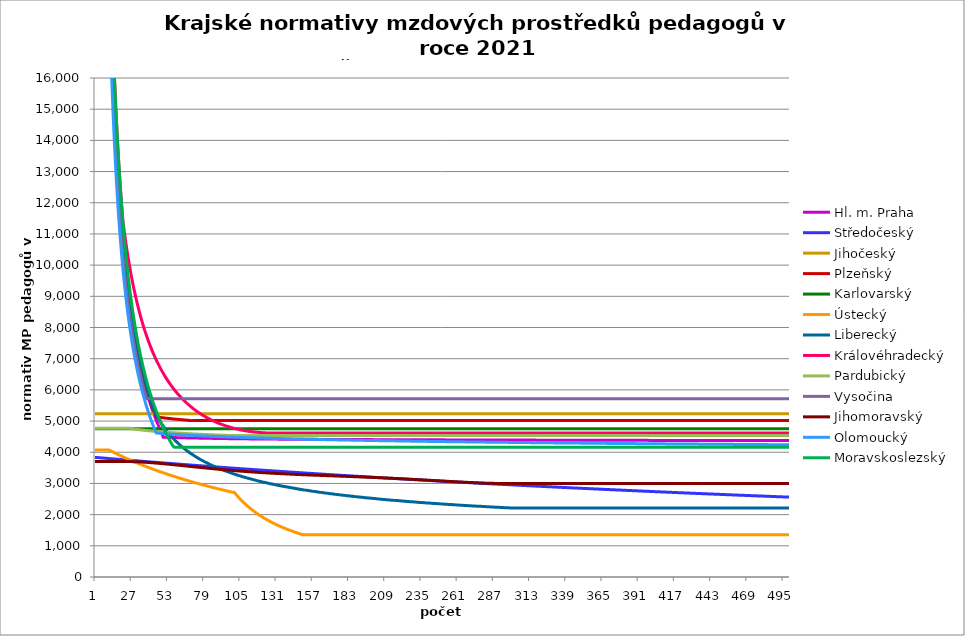
| Category | Hl. m. Praha | Středočeský | Jihočeský | Plzeňský | Karlovarský  | Ústecký   | Liberecký | Královéhradecký | Pardubický | Vysočina | Jihomoravský | Olomoucký | Moravskoslezský |
|---|---|---|---|---|---|---|---|---|---|---|---|---|---|
| 0 | 225960 | 3836.464 | 5236.605 | 230646 | 4750 | 4072.8 | 231600 | 239766 | 4771.19 | 31022.571 | 3704.243 | 207810 | 239400 |
| 1 | 112980 | 3832.635 | 5236.605 | 115323 | 4750 | 4072.8 | 115800 | 119883 | 4771.19 | 31022.571 | 3704.243 | 103905 | 119700 |
| 2 | 75320 | 3828.814 | 5236.605 | 76882 | 4750 | 4072.8 | 77200 | 79922 | 4771.19 | 31022.571 | 3704.243 | 69270 | 79800 |
| 3 | 56490 | 3825 | 5236.605 | 57661.5 | 4750 | 4072.8 | 57900 | 59941.5 | 4771.19 | 31022.571 | 3704.243 | 51952.5 | 59850 |
| 4 | 45192 | 3821.194 | 5236.605 | 46129.2 | 4750 | 4072.8 | 46320 | 47953.2 | 4771.19 | 31022.571 | 3704.243 | 41562 | 47880 |
| 5 | 37660 | 3817.396 | 5236.605 | 38441 | 4750 | 4072.8 | 38600 | 39961 | 4771.19 | 31022.571 | 3704.243 | 34635 | 39900 |
| 6 | 32280 | 3813.605 | 5236.605 | 32949.429 | 4750 | 4072.8 | 33085.714 | 34252.286 | 4771.19 | 31022.571 | 3704.243 | 29687.143 | 34200 |
| 7 | 28245 | 3809.821 | 5236.605 | 28830.75 | 4750 | 4072.8 | 28950 | 29970.75 | 4771.19 | 27144.75 | 3704.243 | 25976.25 | 29925 |
| 8 | 25106.667 | 3806.046 | 5236.605 | 25627.333 | 4750 | 4072.8 | 25733.333 | 26640.667 | 4771.19 | 24128.667 | 3704.243 | 23090 | 26600 |
| 9 | 22596 | 3802.277 | 5236.605 | 23064.6 | 4750 | 4072.8 | 23160 | 23976.6 | 4771.19 | 21715.8 | 3704.243 | 20781 | 23940 |
| 10 | 20541.818 | 3798.516 | 5236.605 | 20967.818 | 4750 | 4072.8 | 21054.545 | 21796.909 | 4771.19 | 19741.636 | 3704.243 | 18891.818 | 21763.636 |
| 11 | 18830 | 3794.763 | 5236.605 | 19220.5 | 4750 | 4050.119 | 19300 | 19980.5 | 4771.19 | 18096.5 | 3704.243 | 17317.5 | 19950 |
| 12 | 17381.538 | 3791.017 | 5236.605 | 17742 | 4750 | 4027.69 | 17815.385 | 18443.538 | 4771.19 | 16704.462 | 3704.243 | 15985.385 | 18415.385 |
| 13 | 16140 | 3787.278 | 5236.605 | 16474.714 | 4750 | 4005.114 | 16542.857 | 17126.143 | 4771.19 | 15511.286 | 3704.243 | 14843.571 | 17100 |
| 14 | 15064 | 3783.547 | 5236.605 | 15376.4 | 4750 | 3983.178 | 15440 | 15984.4 | 4771.19 | 14477.2 | 3704.243 | 13854 | 15960 |
| 15 | 14122.5 | 3779.823 | 5236.605 | 14415.375 | 4750 | 3961.482 | 14475 | 14985.375 | 4771.19 | 13572.375 | 3704.243 | 12988.125 | 14962.5 |
| 16 | 13291.765 | 3776.106 | 5236.605 | 13567.412 | 4750 | 3940.021 | 13623.529 | 14103.882 | 4771.19 | 12774 | 3704.243 | 12224.118 | 14082.353 |
| 17 | 12553.333 | 3772.397 | 5236.605 | 12813.667 | 4750 | 3918.791 | 12866.667 | 13320.333 | 4771.19 | 12064.333 | 3704.243 | 11545 | 13300 |
| 18 | 11892.632 | 3768.695 | 5236.605 | 12139.263 | 4750 | 3897.789 | 12189.474 | 12619.263 | 4771.19 | 11429.368 | 3704.243 | 10937.368 | 12600 |
| 19 | 11298 | 3765 | 5236.605 | 11532.3 | 4750 | 3876.642 | 11580 | 11988.3 | 4771.19 | 10857.9 | 3704.243 | 10390.5 | 11970 |
| 20 | 10760 | 3761.312 | 5236.605 | 10983.143 | 4750 | 3856.088 | 11028.571 | 11433.763 | 4771.19 | 10340.857 | 3704.243 | 9895.714 | 11400 |
| 21 | 10270.909 | 3757.632 | 5236.605 | 10483.909 | 4750 | 3835.751 | 10527.273 | 11087.445 | 4771.19 | 9870.818 | 3704.243 | 9445.909 | 10881.818 |
| 22 | 9824.348 | 3753.959 | 5236.605 | 10028.087 | 4750 | 3815.627 | 10069.565 | 10763.906 | 4771.19 | 9441.652 | 3703.934 | 9035.217 | 10408.696 |
| 23 | 9415 | 3750.293 | 5236.605 | 9610.25 | 4750 | 3795.713 | 9650 | 10465.561 | 4771.19 | 9048.25 | 3703.315 | 8658.75 | 9975 |
| 24 | 9038.4 | 3746.634 | 5236.605 | 9225.84 | 4750 | 3775.656 | 9264 | 10183.309 | 4771.19 | 8686.32 | 3702.697 | 8312.4 | 9576 |
| 25 | 8690.769 | 3742.982 | 5236.605 | 8871 | 4750 | 3756.156 | 8907.692 | 9922.036 | 4763.993 | 8352.231 | 3701.77 | 7992.692 | 9207.692 |
| 26 | 8368.889 | 3739.338 | 5236.605 | 8542.444 | 4750 | 3736.857 | 8577.778 | 9675.787 | 4757.211 | 8042.889 | 3700.534 | 7696.667 | 8866.667 |
| 27 | 8070 | 3735.7 | 5236.605 | 8237.357 | 4750 | 3717.754 | 8271.429 | 9445.184 | 4750.694 | 7755.643 | 3699.299 | 7421.786 | 8550 |
| 28 | 7791.724 | 3732.07 | 5236.605 | 7953.31 | 4750 | 3698.847 | 7986.207 | 9227.093 | 4744.423 | 7488.207 | 3697.757 | 7165.862 | 8255.172 |
| 29 | 7532 | 3728.447 | 5236.605 | 7688.2 | 4750 | 3680.13 | 7720 | 9023.937 | 4738.381 | 7238.6 | 3695.908 | 6927 | 7980 |
| 30 | 7289.032 | 3724.83 | 5236.605 | 7440.194 | 4750 | 3661.273 | 7470.968 | 8829.534 | 4732.551 | 7005.097 | 3694.061 | 6703.548 | 7722.581 |
| 31 | 7061.25 | 3721.221 | 5236.605 | 7207.688 | 4750 | 3642.934 | 7237.5 | 8648.007 | 4726.919 | 6786.188 | 3691.908 | 6494.062 | 7481.25 |
| 32 | 6847.273 | 3717.619 | 5236.605 | 6989.273 | 4750 | 3624.778 | 7018.182 | 8475.292 | 4721.474 | 6580.545 | 3689.758 | 6297.273 | 7254.545 |
| 33 | 6645.882 | 3714.023 | 5236.605 | 6783.706 | 4750 | 3606.801 | 6811.765 | 8310.78 | 4716.204 | 6387 | 3687.304 | 6112.059 | 7041.176 |
| 34 | 6456 | 3710.435 | 5236.605 | 6589.886 | 4750 | 3589.002 | 6617.143 | 8155.306 | 4711.097 | 6204.514 | 3684.853 | 5937.429 | 6840 |
| 35 | 6276.667 | 3706.853 | 5236.605 | 6406.833 | 4750 | 3571.378 | 6433.333 | 8008.216 | 4706.145 | 6032.167 | 3682.099 | 5772.5 | 6650 |
| 36 | 6107.027 | 3703.279 | 5236.605 | 6233.676 | 4750 | 3553.617 | 6259.459 | 7867.629 | 4701.339 | 5869.135 | 3679.35 | 5616.486 | 6470.27 |
| 37 | 5946.316 | 3699.711 | 5236.605 | 6069.632 | 4750 | 3536.338 | 6094.737 | 7734.387 | 4696.67 | 5714.684 | 3676.299 | 5468.684 | 6300 |
| 38 | 5793.846 | 3696.15 | 5236.605 | 5914 | 4750 | 3519.226 | 5938.462 | 7607.996 | 4692.131 | 5714.684 | 3673.254 | 5328.462 | 6138.462 |
| 39 | 5649 | 3692.596 | 5236.605 | 5766.15 | 4750 | 3502.279 | 5790 | 7486.838 | 4687.716 | 5714.684 | 3669.911 | 5195.25 | 5985 |
| 40 | 5511.22 | 3689.049 | 5236.605 | 5625.512 | 4750 | 3485.494 | 5648.78 | 7370.612 | 4683.418 | 5714.684 | 3666.573 | 5068.537 | 5839.024 |
| 41 | 5380 | 3685.509 | 5236.605 | 5491.571 | 4750 | 3468.574 | 5514.286 | 7260.136 | 4679.231 | 5714.684 | 3663.241 | 4947.857 | 5700 |
| 42 | 5254.884 | 3681.975 | 5236.605 | 5363.86 | 4750 | 3452.111 | 5386.047 | 7155.058 | 4675.149 | 5714.684 | 3659.614 | 4832.791 | 5567.442 |
| 43 | 5135.455 | 3678.448 | 5236.605 | 5241.955 | 4750 | 3435.802 | 5281.298 | 7054.016 | 4671.169 | 5714.684 | 3655.993 | 4722.955 | 5440.909 |
| 44 | 5021.333 | 3674.928 | 5236.605 | 5131.739 | 4750 | 3419.647 | 5196.908 | 6957.806 | 4667.284 | 5714.684 | 3652.38 | 4618 | 5320 |
| 45 | 4912.174 | 3671.415 | 5236.605 | 5126.036 | 4750 | 3403.644 | 5116.941 | 6865.168 | 4663.491 | 5714.684 | 3648.474 | 4614.411 | 5204.348 |
| 46 | 4807.66 | 3667.908 | 5236.605 | 5119.778 | 4750 | 3387.789 | 5041.041 | 6775.922 | 4659.786 | 5714.684 | 3644.576 | 4610.828 | 5093.617 |
| 47 | 4707.5 | 3664.408 | 5236.605 | 5114.102 | 4750 | 3371.802 | 4968.889 | 6690.833 | 4656.164 | 5714.684 | 3640.686 | 4607.25 | 4987.5 |
| 48 | 4611.429 | 3660.915 | 5236.605 | 5109.004 | 4750 | 3356.242 | 4900.199 | 6609.676 | 4652.622 | 5714.684 | 3636.507 | 4603.677 | 4885.714 |
| 49 | 4480.666 | 3657.429 | 5236.605 | 5103.352 | 4750 | 3340.825 | 4834.714 | 6531.354 | 4649.157 | 5714.684 | 3632.634 | 4600.111 | 4788 |
| 50 | 4479.334 | 3653.949 | 5236.605 | 5098.276 | 4750 | 3325.549 | 4772.202 | 6455.735 | 4645.766 | 5714.684 | 3628.473 | 4596.549 | 4694.118 |
| 51 | 4478.002 | 3650.475 | 5236.605 | 5093.21 | 4750 | 3310.412 | 4712.454 | 6383.546 | 4642.446 | 5714.684 | 3624.025 | 4593.501 | 4603.846 |
| 52 | 4476.672 | 3647.009 | 5236.605 | 5088.154 | 4750 | 3295.146 | 4655.281 | 6313.785 | 4639.193 | 5714.684 | 3619.884 | 4590.457 | 4516.981 |
| 53 | 4475.342 | 3643.548 | 5236.605 | 5083.107 | 4750 | 3280.284 | 4600.509 | 6247.16 | 4636.005 | 5714.684 | 3615.457 | 4586.911 | 4433.333 |
| 54 | 4474.455 | 3640.095 | 5236.605 | 5078.63 | 4750 | 3265.555 | 4547.981 | 6182.723 | 4632.881 | 5714.684 | 3611.041 | 4583.876 | 4352.727 |
| 55 | 4473.127 | 3636.648 | 5236.605 | 5073.603 | 4750 | 3250.958 | 4497.554 | 6121.164 | 4629.816 | 5714.684 | 3606.636 | 4580.844 | 4275 |
| 56 | 4471.799 | 3633.207 | 5236.605 | 5069.143 | 4750 | 3236.491 | 4449.097 | 6060.819 | 4626.81 | 5714.684 | 3602.242 | 4577.817 | 4200 |
| 57 | 4470.472 | 3629.773 | 5236.605 | 5064.69 | 4750 | 3222.152 | 4402.489 | 6003.906 | 4623.86 | 5714.684 | 3597.858 | 4575.297 | 4159.138 |
| 58 | 4469.588 | 3626.346 | 5236.605 | 5060.246 | 4750 | 3207.687 | 4357.619 | 5948.053 | 4620.964 | 5714.684 | 3593.194 | 4572.277 | 4159.138 |
| 59 | 4468.262 | 3622.925 | 5236.605 | 5055.809 | 4750 | 3193.602 | 4314.387 | 5894.677 | 4618.12 | 5714.684 | 3588.832 | 4569.261 | 4159.138 |
| 60 | 4467.378 | 3619.51 | 5236.605 | 5051.38 | 4750 | 3179.639 | 4272.698 | 5843.675 | 4615.327 | 5714.684 | 3584.191 | 4566.751 | 4159.138 |
| 61 | 4466.054 | 3616.102 | 5236.605 | 5046.958 | 4750 | 3165.799 | 4232.465 | 5794.248 | 4612.582 | 5714.684 | 3579.563 | 4563.742 | 4159.138 |
| 62 | 4465.171 | 3612.7 | 5236.605 | 5043.096 | 4750 | 3152.078 | 4193.609 | 5746.339 | 4609.885 | 5714.684 | 3574.946 | 4561.238 | 4159.138 |
| 63 | 4463.848 | 3609.305 | 5236.605 | 5038.689 | 4750 | 3138.234 | 4156.055 | 5699.893 | 4607.233 | 5714.684 | 3570.341 | 4558.736 | 4159.138 |
| 64 | 4462.967 | 3605.915 | 5236.605 | 5034.84 | 4750 | 3124.751 | 4119.735 | 5655.525 | 4604.625 | 5714.684 | 3565.747 | 4556.238 | 4159.138 |
| 65 | 4462.085 | 3602.533 | 5236.605 | 5030.996 | 4750 | 3111.383 | 4084.585 | 5612.5 | 4602.06 | 5714.684 | 3561.166 | 4553.243 | 4159.138 |
| 66 | 4460.764 | 3599.157 | 5236.605 | 5027.158 | 4750 | 3098.129 | 4050.544 | 5570.771 | 4599.536 | 5714.684 | 3556.596 | 4550.75 | 4159.138 |
| 67 | 4459.884 | 3595.787 | 5236.605 | 5023.326 | 4750 | 3084.987 | 4017.558 | 5530.934 | 4597.052 | 5714.684 | 3552.038 | 4548.758 | 4159.138 |
| 68 | 4459.003 | 3592.423 | 5236.605 | 5019.499 | 4750 | 3071.957 | 3985.575 | 5492.292 | 4594.608 | 5714.684 | 3547.492 | 4546.27 | 4159.138 |
| 69 | 4458.124 | 3589.065 | 5236.605 | 5015.679 | 4750 | 3058.806 | 3954.547 | 5454.806 | 4592.201 | 5714.684 | 3542.675 | 4543.785 | 4159.138 |
| 70 | 4457.244 | 3585.714 | 5236.605 | 5014.043 | 4750 | 3045.995 | 3924.428 | 5418.441 | 4589.83 | 5714.684 | 3538.152 | 4541.302 | 4159.138 |
| 71 | 4456.365 | 3582.369 | 5236.605 | 5014.043 | 4750 | 3033.291 | 3895.176 | 5383.766 | 4587.495 | 5714.684 | 3533.641 | 4538.823 | 4159.138 |
| 72 | 4455.047 | 3579.031 | 5236.605 | 5014.043 | 4750 | 3020.693 | 3866.752 | 5350.128 | 4585.195 | 5714.684 | 3528.861 | 4536.841 | 4159.138 |
| 73 | 4454.169 | 3575.698 | 5236.605 | 5014.043 | 4750 | 3008.199 | 3839.118 | 5317.498 | 4582.928 | 5714.684 | 3524.374 | 4534.366 | 4159.138 |
| 74 | 4453.291 | 3572.372 | 5236.605 | 5014.043 | 4750 | 2995.587 | 3812.239 | 5286.429 | 4580.694 | 5714.684 | 3519.898 | 4532.388 | 4159.138 |
| 75 | 4452.414 | 3569.052 | 5236.605 | 5014.043 | 4750 | 2983.299 | 3786.083 | 5255.721 | 4578.491 | 5714.684 | 3515.155 | 4529.918 | 4159.138 |
| 76 | 4451.537 | 3565.738 | 5236.605 | 5014.043 | 4750 | 2971.112 | 3760.618 | 5226.507 | 4576.32 | 5714.684 | 3510.703 | 4527.944 | 4159.138 |
| 77 | 4450.66 | 3562.43 | 5236.605 | 5014.043 | 4750 | 2959.024 | 3735.815 | 5198.179 | 4574.178 | 5714.684 | 3506.262 | 4525.972 | 4159.138 |
| 78 | 4449.783 | 3559.129 | 5236.605 | 5014.043 | 4750 | 2947.033 | 3711.647 | 5170.714 | 4572.066 | 5714.684 | 3501.832 | 4524.001 | 4159.138 |
| 79 | 4448.907 | 3555.833 | 5236.605 | 5014.043 | 4750 | 2935.14 | 3688.088 | 5144.641 | 4569.982 | 5714.684 | 3497.413 | 4521.54 | 4159.138 |
| 80 | 4448.469 | 3552.544 | 5236.605 | 5014.043 | 4750 | 2923.132 | 3665.114 | 5118.83 | 4567.926 | 5714.684 | 3493.006 | 4519.574 | 4159.138 |
| 81 | 4447.594 | 3549.261 | 5236.605 | 5014.043 | 4750 | 2911.43 | 3642.7 | 5094.359 | 4565.897 | 5714.684 | 3488.609 | 4517.609 | 4159.138 |
| 82 | 4446.718 | 3545.983 | 5236.605 | 5014.043 | 4750 | 2899.822 | 3620.826 | 5070.657 | 4563.894 | 5714.684 | 3484.224 | 4515.645 | 4159.138 |
| 83 | 4445.844 | 3542.712 | 5236.605 | 5014.043 | 4750 | 2888.306 | 3599.471 | 5047.705 | 4561.917 | 5714.684 | 3479.849 | 4513.684 | 4159.138 |
| 84 | 4444.969 | 3539.447 | 5236.605 | 5014.043 | 4750 | 2876.881 | 3578.614 | 5026.014 | 4559.965 | 5714.684 | 3475.486 | 4511.724 | 4159.138 |
| 85 | 4444.095 | 3536.188 | 5236.605 | 5014.043 | 4750 | 2865.546 | 3558.237 | 5004.508 | 4558.038 | 5714.684 | 3471.133 | 4509.766 | 4159.138 |
| 86 | 4443.658 | 3532.935 | 5236.605 | 5014.043 | 4750 | 2854.1 | 3538.322 | 4983.704 | 4556.134 | 5714.684 | 3467.063 | 4507.809 | 4159.138 |
| 87 | 4442.784 | 3529.688 | 5236.605 | 5014.043 | 4750 | 2842.943 | 3518.853 | 4964.099 | 4554.254 | 5714.684 | 3462.731 | 4506.343 | 4159.138 |
| 88 | 4441.911 | 3526.446 | 5236.605 | 5014.043 | 4750 | 2831.873 | 3499.814 | 4945.158 | 4552.396 | 5714.684 | 3458.68 | 4504.389 | 4159.138 |
| 89 | 4441.474 | 3523.211 | 5236.605 | 5014.043 | 4750 | 2820.889 | 3481.189 | 4926.361 | 4550.561 | 5714.684 | 3454.37 | 4502.437 | 4159.138 |
| 90 | 4440.601 | 3519.982 | 5236.605 | 5014.043 | 4750 | 2809.99 | 3462.963 | 4908.711 | 4548.748 | 5714.684 | 3450.338 | 4500.487 | 4159.138 |
| 91 | 4439.729 | 3516.758 | 5236.605 | 5014.043 | 4750 | 2798.983 | 3445.124 | 4891.686 | 4546.955 | 5714.684 | 3446.316 | 4499.026 | 4159.138 |
| 92 | 4439.293 | 3513.541 | 5236.605 | 5014.043 | 4750 | 2788.252 | 3427.657 | 4875.275 | 4545.184 | 5714.684 | 3442.304 | 4497.079 | 4159.138 |
| 93 | 4438.421 | 3510.329 | 5236.605 | 5014.043 | 4750 | 2777.603 | 3410.55 | 4859.465 | 4543.433 | 5714.684 | 3438.301 | 4495.619 | 4159.138 |
| 94 | 4437.549 | 3507.123 | 5236.605 | 5014.043 | 4750 | 2767.036 | 3393.792 | 4844.736 | 4541.701 | 5714.684 | 3434.307 | 4493.675 | 4159.138 |
| 95 | 4437.113 | 3503.923 | 5236.605 | 5014.043 | 4750 | 2756.548 | 3377.371 | 4830.097 | 4539.99 | 5714.684 | 3430.587 | 4492.218 | 4159.138 |
| 96 | 4436.242 | 3500.729 | 5236.605 | 5014.043 | 4750 | 2746.14 | 3361.275 | 4816.029 | 4538.297 | 5714.684 | 3426.611 | 4490.277 | 4159.138 |
| 97 | 4435.807 | 3497.541 | 5236.605 | 5014.043 | 4750 | 2735.626 | 3345.495 | 4802.524 | 4536.622 | 5714.684 | 3422.908 | 4488.822 | 4159.138 |
| 98 | 4434.936 | 3494.359 | 5236.605 | 5014.043 | 4750 | 2725.375 | 3330.02 | 4789.573 | 4534.966 | 5714.684 | 3418.95 | 4486.883 | 4159.138 |
| 99 | 4434.066 | 3491.182 | 5236.605 | 5014.043 | 4750 | 2715.2 | 3314.841 | 4777.643 | 4533.328 | 5714.684 | 3415.264 | 4485.431 | 4159.138 |
| 100 | 4433.631 | 3488.011 | 5236.605 | 5014.043 | 4750 | 2715.2 | 3299.949 | 4765.772 | 4533.328 | 5714.684 | 3411.586 | 4483.979 | 4159.138 |
| 101 | 4433.196 | 3484.846 | 5236.605 | 5014.043 | 4750 | 2660.917 | 3285.335 | 4754.432 | 4533.328 | 5714.684 | 3407.915 | 4482.045 | 4159.138 |
| 102 | 4432.761 | 3481.686 | 5236.605 | 5014.043 | 4750 | 2608.762 | 3270.99 | 4743.615 | 4533.328 | 5714.684 | 3404.514 | 4480.595 | 4159.138 |
| 103 | 4432.326 | 3478.533 | 5236.605 | 5014.043 | 4750 | 2558.613 | 3256.907 | 4733.314 | 4533.328 | 5714.684 | 3400.859 | 4479.146 | 4159.138 |
| 104 | 4431.892 | 3475.385 | 5236.605 | 5014.043 | 4750 | 2510.355 | 3243.078 | 4723.522 | 4533.328 | 5714.684 | 3397.472 | 4477.699 | 4159.138 |
| 105 | 4431.457 | 3472.242 | 5236.605 | 5014.043 | 4750 | 2463.735 | 3229.495 | 4714.699 | 4533.328 | 5714.684 | 3393.832 | 4476.252 | 4159.138 |
| 106 | 4431.023 | 3469.106 | 5236.605 | 5014.043 | 4750 | 2418.958 | 3216.152 | 4705.908 | 4533.328 | 5714.684 | 3390.459 | 4474.806 | 4159.138 |
| 107 | 4430.588 | 3465.975 | 5236.605 | 5014.043 | 4750 | 2375.78 | 3203.041 | 4697.61 | 4533.328 | 5714.684 | 3387.092 | 4472.88 | 4159.138 |
| 108 | 4430.154 | 3462.849 | 5236.605 | 5014.043 | 4750 | 2334.117 | 3190.155 | 4689.341 | 4533.328 | 5714.684 | 3383.733 | 4471.436 | 4159.138 |
| 109 | 4429.72 | 3459.73 | 5236.605 | 5014.043 | 4750 | 2293.889 | 3177.489 | 4682.015 | 4533.328 | 5714.684 | 3380.38 | 4469.994 | 4159.138 |
| 110 | 4429.286 | 3456.616 | 5236.605 | 5014.043 | 4750 | 2255.025 | 3165.037 | 4675.168 | 4533.328 | 5714.684 | 3377.29 | 4468.552 | 4159.138 |
| 111 | 4428.851 | 3453.507 | 5236.605 | 5014.043 | 4750 | 2217.455 | 3152.792 | 4668.341 | 4533.328 | 5714.684 | 3373.95 | 4467.111 | 4159.138 |
| 112 | 4428.417 | 3450.404 | 5236.605 | 5014.043 | 4750 | 2181.117 | 3140.749 | 4662.44 | 4533.328 | 5714.684 | 3370.873 | 4465.671 | 4159.138 |
| 113 | 4427.984 | 3447.307 | 5236.605 | 5014.043 | 4750 | 2145.838 | 3128.903 | 4656.555 | 4533.328 | 5714.684 | 3367.801 | 4464.232 | 4159.138 |
| 114 | 4427.55 | 3444.215 | 5236.605 | 5014.043 | 4750 | 2111.791 | 3117.248 | 4651.135 | 4533.328 | 5714.684 | 3364.734 | 4463.273 | 4159.138 |
| 115 | 4427.116 | 3441.129 | 5236.605 | 5014.043 | 4750 | 2078.808 | 3105.78 | 4646.178 | 4533.328 | 5714.684 | 3361.674 | 4461.836 | 4159.138 |
| 116 | 4426.682 | 3438.048 | 5236.605 | 5014.043 | 4750 | 2046.839 | 3094.493 | 4641.68 | 4533.328 | 5714.684 | 3358.619 | 4460.399 | 4159.138 |
| 117 | 4426.249 | 3434.973 | 5236.605 | 5014.043 | 4750 | 2015.838 | 3083.382 | 4637.64 | 4533.328 | 5714.684 | 3355.569 | 4458.964 | 4159.138 |
| 118 | 4425.815 | 3431.903 | 5236.605 | 5014.043 | 4750 | 1985.763 | 3072.444 | 4634.055 | 4533.328 | 5714.684 | 3352.778 | 4457.529 | 4159.138 |
| 119 | 4425.382 | 3428.839 | 5236.605 | 5014.043 | 4750 | 1956.572 | 3061.674 | 4630.475 | 4533.328 | 5714.684 | 3349.992 | 4456.095 | 4159.138 |
| 120 | 4424.949 | 3425.781 | 5236.605 | 5014.043 | 4750 | 1928.226 | 3051.067 | 4627.347 | 4533.328 | 5714.684 | 3347.211 | 4455.14 | 4159.138 |
| 121 | 4424.515 | 3422.727 | 5236.605 | 5014.043 | 4750 | 1900.602 | 3040.62 | 4624.67 | 4533.328 | 5714.684 | 3344.434 | 4453.708 | 4159.138 |
| 122 | 4424.082 | 3419.679 | 5236.605 | 5014.043 | 4750 | 1873.844 | 3030.329 | 4622.441 | 4533.328 | 5714.684 | 3341.662 | 4452.276 | 4159.138 |
| 123 | 4424.082 | 3416.637 | 5236.605 | 5014.043 | 4750 | 1847.829 | 3020.19 | 4620.659 | 4533.328 | 5714.684 | 3338.895 | 4450.846 | 4159.138 |
| 124 | 4423.649 | 3413.6 | 5236.605 | 5014.043 | 4750 | 1822.527 | 3010.199 | 4618.879 | 4533.328 | 5714.684 | 3336.132 | 4449.893 | 4159.138 |
| 125 | 4423.216 | 3410.568 | 5236.605 | 5014.043 | 4750 | 1797.908 | 3000.352 | 4617.545 | 4533.328 | 5714.684 | 3333.624 | 4448.464 | 4159.138 |
| 126 | 4422.783 | 3407.542 | 5236.605 | 5014.043 | 4750 | 1773.945 | 2990.647 | 4616.655 | 4533.328 | 5714.684 | 3330.87 | 4447.036 | 4159.138 |
| 127 | 4422.351 | 3404.521 | 5236.605 | 5014.043 | 4750 | 1750.613 | 2981.08 | 4616.211 | 4533.328 | 5714.684 | 3328.37 | 4446.085 | 4159.138 |
| 128 | 4421.918 | 3401.506 | 5236.605 | 5014.043 | 4750 | 1727.886 | 2971.648 | 4615.767 | 4533.328 | 5714.684 | 3325.874 | 4444.658 | 4159.138 |
| 129 | 4421.485 | 3398.496 | 5236.605 | 5014.043 | 4750 | 1705.67 | 2962.347 | 4615.767 | 4533.328 | 5714.684 | 3323.381 | 4443.708 | 4159.138 |
| 130 | 4421.485 | 3395.491 | 5236.605 | 5014.043 | 4750 | 1684.089 | 2953.175 | 4615.767 | 4533.328 | 5714.684 | 3320.893 | 4442.283 | 4159.138 |
| 131 | 4421.053 | 3392.491 | 5236.605 | 5014.043 | 4750 | 1663.046 | 2944.129 | 4615.767 | 4533.328 | 5714.684 | 3318.656 | 4441.334 | 4159.138 |
| 132 | 4420.62 | 3389.497 | 5236.605 | 5014.043 | 4750 | 1642.523 | 2935.206 | 4615.767 | 4533.328 | 5714.684 | 3316.174 | 4439.91 | 4159.138 |
| 133 | 4420.188 | 3386.508 | 5236.605 | 5014.043 | 4750 | 1622.5 | 2926.402 | 4615.767 | 4533.328 | 5714.684 | 3313.944 | 4438.962 | 4159.138 |
| 134 | 4419.756 | 3383.524 | 5236.605 | 5014.043 | 4750 | 1602.96 | 2917.717 | 4615.767 | 4533.328 | 5714.684 | 3311.47 | 4437.54 | 4159.138 |
| 135 | 4419.756 | 3380.546 | 5236.605 | 5014.043 | 4750 | 1583.884 | 2909.146 | 4615.767 | 4533.328 | 5714.684 | 3309.246 | 4436.593 | 4159.138 |
| 136 | 4419.323 | 3377.573 | 5236.605 | 5014.043 | 4750 | 1565.257 | 2900.688 | 4615.767 | 4533.328 | 5714.684 | 3307.025 | 4435.172 | 4159.138 |
| 137 | 4418.891 | 3374.605 | 5236.605 | 5014.043 | 4750 | 1547.005 | 2892.339 | 4615.767 | 4533.328 | 5714.684 | 3304.807 | 4434.226 | 4159.138 |
| 138 | 4418.459 | 3371.642 | 5236.605 | 5014.043 | 4750 | 1529.231 | 2884.099 | 4615.767 | 4533.328 | 5714.684 | 3302.592 | 4432.807 | 4159.138 |
| 139 | 4418.027 | 3368.684 | 5236.605 | 5014.043 | 4750 | 1511.86 | 2875.963 | 4615.767 | 4533.328 | 5714.684 | 3300.625 | 4431.862 | 4159.138 |
| 140 | 4418.027 | 3365.732 | 5236.605 | 5014.043 | 4750 | 1494.88 | 2867.931 | 4615.767 | 4533.328 | 5714.684 | 3298.416 | 4430.917 | 4159.138 |
| 141 | 4417.595 | 3362.785 | 5236.605 | 5014.043 | 4750 | 1478.277 | 2860 | 4615.767 | 4533.328 | 5714.684 | 3296.209 | 4429.5 | 4159.138 |
| 142 | 4417.164 | 3359.843 | 5236.605 | 5014.043 | 4750 | 1462.038 | 2852.168 | 4615.767 | 4533.328 | 5714.684 | 3294.25 | 4428.556 | 4159.138 |
| 143 | 4416.732 | 3356.906 | 5236.605 | 5014.043 | 4750 | 1446.153 | 2844.433 | 4615.767 | 4533.328 | 5714.684 | 3292.294 | 4427.613 | 4159.138 |
| 144 | 4416.732 | 3353.974 | 5236.605 | 5014.043 | 4750 | 1430.609 | 2836.793 | 4615.767 | 4533.328 | 5714.684 | 3290.096 | 4426.198 | 4159.138 |
| 145 | 4416.3 | 3351.047 | 5236.605 | 5014.043 | 4750 | 1415.346 | 2829.246 | 4615.767 | 4533.328 | 5714.684 | 3288.144 | 4425.256 | 4159.138 |
| 146 | 4415.869 | 3348.126 | 5236.605 | 5014.043 | 4750 | 1400.454 | 2821.79 | 4615.767 | 4533.328 | 5714.684 | 3286.195 | 4424.313 | 4159.138 |
| 147 | 4415.437 | 3345.209 | 5236.605 | 5014.043 | 4750 | 1385.872 | 2814.423 | 4615.767 | 4533.328 | 5714.684 | 3284.248 | 4423.372 | 4159.138 |
| 148 | 4415.437 | 3342.298 | 5236.605 | 5014.043 | 4750 | 1371.59 | 2807.144 | 4615.767 | 4533.328 | 5714.684 | 3282.303 | 4421.96 | 4159.138 |
| 149 | 4415.006 | 3339.391 | 5236.605 | 5014.043 | 4750 | 1357.6 | 2799.951 | 4615.767 | 4533.328 | 5714.684 | 3280.361 | 4421.019 | 4159.138 |
| 150 | 4415.006 | 3336.49 | 5236.605 | 5014.043 | 4750 | 1357.6 | 2792.842 | 4615.767 | 4533.328 | 5714.684 | 3278.421 | 4420.079 | 4159.138 |
| 151 | 4414.575 | 3333.594 | 5236.605 | 5014.043 | 4750 | 1357.6 | 2785.815 | 4615.767 | 4533.328 | 5714.684 | 3276.725 | 4419.139 | 4159.138 |
| 152 | 4414.575 | 3330.703 | 5236.605 | 5014.043 | 4750 | 1357.6 | 2778.87 | 4615.767 | 4533.328 | 5714.684 | 3274.79 | 4417.73 | 4159.138 |
| 153 | 4414.143 | 3327.816 | 5236.605 | 5014.043 | 4750 | 1357.6 | 2772.004 | 4615.767 | 4533.328 | 5714.684 | 3273.098 | 4416.791 | 4159.138 |
| 154 | 4414.143 | 3324.935 | 5236.605 | 5014.043 | 4750 | 1357.6 | 2765.216 | 4615.767 | 4533.328 | 5714.684 | 3271.166 | 4415.852 | 4159.138 |
| 155 | 4413.712 | 3322.059 | 5236.605 | 5014.043 | 4750 | 1357.6 | 2758.504 | 4615.767 | 4533.328 | 5714.684 | 3269.478 | 4414.914 | 4159.138 |
| 156 | 4413.712 | 3319.188 | 5236.605 | 5014.043 | 4750 | 1357.6 | 2751.868 | 4615.767 | 4533.328 | 5714.684 | 3267.551 | 4413.976 | 4159.138 |
| 157 | 4413.281 | 3316.321 | 5236.605 | 5014.043 | 4750 | 1357.6 | 2745.305 | 4615.767 | 4533.328 | 5714.684 | 3265.866 | 4413.039 | 4159.138 |
| 158 | 4413.281 | 3313.46 | 5236.605 | 5014.043 | 4750 | 1357.6 | 2738.815 | 4615.767 | 4533.328 | 5714.684 | 3264.184 | 4412.102 | 4159.138 |
| 159 | 4412.85 | 3310.603 | 5236.605 | 5014.043 | 4750 | 1357.6 | 2732.395 | 4615.767 | 4533.328 | 5714.684 | 3262.263 | 4411.165 | 4159.138 |
| 160 | 4412.85 | 3307.752 | 5236.605 | 5014.043 | 4750 | 1357.6 | 2726.046 | 4615.767 | 4533.328 | 5714.684 | 3260.584 | 4409.761 | 4159.138 |
| 161 | 4412.419 | 3304.905 | 5236.605 | 5014.043 | 4750 | 1357.6 | 2719.764 | 4615.767 | 4533.328 | 5714.684 | 3258.907 | 4408.826 | 4159.138 |
| 162 | 4412.419 | 3302.064 | 5236.605 | 5014.043 | 4750 | 1357.6 | 2713.55 | 4615.767 | 4533.328 | 5714.684 | 3257.231 | 4407.891 | 4159.138 |
| 163 | 4411.989 | 3299.227 | 5236.605 | 5014.043 | 4750 | 1357.6 | 2707.403 | 4615.767 | 4533.328 | 5714.684 | 3255.557 | 4406.956 | 4159.138 |
| 164 | 4411.989 | 3296.395 | 5236.605 | 5014.043 | 4750 | 1357.6 | 2701.32 | 4615.767 | 4533.328 | 5714.684 | 3253.885 | 4406.021 | 4159.138 |
| 165 | 4411.558 | 3293.568 | 5236.605 | 5014.043 | 4750 | 1357.6 | 2695.301 | 4615.767 | 4533.328 | 5714.684 | 3252.215 | 4405.087 | 4159.138 |
| 166 | 4411.558 | 3290.746 | 5236.605 | 5014.043 | 4750 | 1357.6 | 2689.344 | 4615.767 | 4533.328 | 5714.684 | 3250.546 | 4404.154 | 4159.138 |
| 167 | 4411.127 | 3287.928 | 5236.605 | 5014.043 | 4750 | 1357.6 | 2683.449 | 4615.767 | 4533.328 | 5714.684 | 3248.879 | 4403.221 | 4159.138 |
| 168 | 4411.127 | 3285.115 | 5236.605 | 5014.043 | 4750 | 1357.6 | 2677.615 | 4615.767 | 4533.328 | 5714.684 | 3247.214 | 4402.288 | 4159.138 |
| 169 | 4410.697 | 3282.308 | 5236.605 | 5014.043 | 4750 | 1357.6 | 2671.84 | 4615.767 | 4533.328 | 5714.684 | 3245.55 | 4401.356 | 4159.138 |
| 170 | 4410.697 | 3279.505 | 5236.605 | 5014.043 | 4750 | 1357.6 | 2666.124 | 4615.767 | 4533.328 | 5714.684 | 3243.889 | 4400.424 | 4159.138 |
| 171 | 4410.266 | 3276.706 | 5236.605 | 5014.043 | 4750 | 1357.6 | 2660.465 | 4615.767 | 4533.328 | 5714.684 | 3242.228 | 4399.492 | 4159.138 |
| 172 | 4410.266 | 3273.913 | 5236.605 | 5014.043 | 4750 | 1357.6 | 2654.863 | 4615.767 | 4533.328 | 5714.684 | 3240.57 | 4399.026 | 4159.138 |
| 173 | 4409.836 | 3271.124 | 5236.605 | 5014.043 | 4750 | 1357.6 | 2649.316 | 4615.767 | 4533.328 | 5714.684 | 3238.913 | 4398.095 | 4159.138 |
| 174 | 4409.836 | 3268.34 | 5236.605 | 5014.043 | 4750 | 1357.6 | 2643.824 | 4615.767 | 4533.328 | 5714.684 | 3237.258 | 4397.165 | 4159.138 |
| 175 | 4409.406 | 3265.561 | 5236.605 | 5014.043 | 4750 | 1357.6 | 2638.386 | 4615.767 | 4533.328 | 5714.684 | 3235.605 | 4396.234 | 4159.138 |
| 176 | 4409.406 | 3262.787 | 5236.605 | 5014.043 | 4750 | 1357.6 | 2633.001 | 4615.767 | 4533.328 | 5714.684 | 3233.717 | 4395.305 | 4159.138 |
| 177 | 4408.976 | 3260.017 | 5236.605 | 5014.043 | 4750 | 1357.6 | 2627.668 | 4615.767 | 4533.328 | 5714.684 | 3232.068 | 4394.375 | 4159.138 |
| 178 | 4408.976 | 3257.252 | 5236.605 | 5014.043 | 4750 | 1357.6 | 2622.386 | 4615.767 | 4533.328 | 5714.684 | 3230.42 | 4393.446 | 4159.138 |
| 179 | 4408.546 | 3254.492 | 5236.605 | 5014.043 | 4750 | 1357.6 | 2617.155 | 4615.767 | 4533.328 | 5714.684 | 3228.773 | 4392.517 | 4159.138 |
| 180 | 4408.546 | 3251.736 | 5236.605 | 5014.043 | 4750 | 1357.6 | 2611.973 | 4615.767 | 4533.328 | 5714.684 | 3227.129 | 4391.589 | 4159.138 |
| 181 | 4408.546 | 3248.985 | 5236.605 | 5014.043 | 4750 | 1357.6 | 2606.841 | 4615.767 | 4533.328 | 5714.684 | 3225.485 | 4391.125 | 4159.138 |
| 182 | 4408.115 | 3246.238 | 5236.605 | 5014.043 | 4750 | 1357.6 | 2601.756 | 4615.767 | 4533.328 | 5714.684 | 3223.844 | 4390.198 | 4159.138 |
| 183 | 4408.115 | 3243.497 | 5236.605 | 5014.043 | 4750 | 1357.6 | 2596.718 | 4615.767 | 4533.328 | 5714.684 | 3222.204 | 4389.27 | 4159.138 |
| 184 | 4407.686 | 3240.759 | 5236.605 | 5014.043 | 4750 | 1357.6 | 2591.728 | 4615.767 | 4533.328 | 5714.684 | 3220.333 | 4388.343 | 4159.138 |
| 185 | 4407.686 | 3238.027 | 5236.605 | 5014.043 | 4750 | 1357.6 | 2586.783 | 4615.767 | 4533.328 | 5714.684 | 3218.696 | 4387.417 | 4159.138 |
| 186 | 4407.256 | 3235.299 | 5236.605 | 5014.043 | 4750 | 1357.6 | 2581.883 | 4615.767 | 4533.328 | 5714.684 | 3217.062 | 4386.954 | 4159.138 |
| 187 | 4407.256 | 3232.576 | 5236.605 | 5014.043 | 4750 | 1357.6 | 2577.028 | 4615.767 | 4533.328 | 5714.684 | 3215.196 | 4386.028 | 4159.138 |
| 188 | 4406.826 | 3229.857 | 5236.605 | 5014.043 | 4750 | 1357.6 | 2572.217 | 4615.767 | 4533.328 | 5714.684 | 3213.565 | 4385.102 | 4159.138 |
| 189 | 4406.826 | 3227.143 | 5236.605 | 5014.043 | 4750 | 1357.6 | 2567.449 | 4615.767 | 4533.328 | 5714.684 | 3211.703 | 4384.177 | 4159.138 |
| 190 | 4406.826 | 3224.433 | 5236.605 | 5014.043 | 4750 | 1357.6 | 2562.723 | 4615.767 | 4533.328 | 5714.684 | 3210.076 | 4383.715 | 4159.138 |
| 191 | 4406.396 | 3221.728 | 5236.605 | 5014.043 | 4750 | 1357.6 | 2558.039 | 4615.767 | 4533.328 | 5714.684 | 3208.218 | 4382.79 | 4159.138 |
| 192 | 4406.396 | 3219.028 | 5236.605 | 5014.043 | 4750 | 1357.6 | 2553.397 | 4615.767 | 4533.328 | 5714.684 | 3206.363 | 4381.866 | 4159.138 |
| 193 | 4405.967 | 3216.332 | 5236.605 | 5014.043 | 4750 | 1357.6 | 2548.795 | 4615.767 | 4533.328 | 5714.684 | 3204.741 | 4380.942 | 4159.138 |
| 194 | 4405.967 | 3213.64 | 5236.605 | 5014.043 | 4750 | 1357.6 | 2544.233 | 4615.767 | 4533.328 | 5714.684 | 3202.889 | 4380.481 | 4159.138 |
| 195 | 4405.537 | 3210.953 | 5236.605 | 5014.043 | 4750 | 1357.6 | 2539.711 | 4615.767 | 4533.328 | 5714.684 | 3201.039 | 4379.557 | 4159.138 |
| 196 | 4405.537 | 3208.271 | 5236.605 | 5014.043 | 4750 | 1357.6 | 2535.228 | 4615.767 | 4533.328 | 5714.684 | 3199.192 | 4378.635 | 4159.138 |
| 197 | 4405.537 | 3205.593 | 5236.605 | 5014.043 | 4750 | 1357.6 | 2530.783 | 4615.767 | 4533.328 | 5714.684 | 3197.347 | 4378.173 | 4159.138 |
| 198 | 4405.108 | 3202.919 | 5236.605 | 5014.043 | 4750 | 1357.6 | 2526.376 | 4615.767 | 4533.328 | 5714.684 | 3195.504 | 4377.251 | 4159.138 |
| 199 | 4405.108 | 3200.25 | 5236.605 | 5014.043 | 4750 | 1357.6 | 2522.007 | 4615.767 | 4533.328 | 5714.684 | 3193.663 | 4376.329 | 4159.138 |
| 200 | 4404.678 | 3197.585 | 5236.605 | 5014.043 | 4750 | 1357.6 | 2517.674 | 4615.767 | 4533.328 | 5714.684 | 3191.594 | 4375.869 | 4159.138 |
| 201 | 4404.678 | 3194.925 | 5236.605 | 5014.043 | 4750 | 1357.6 | 2513.377 | 4615.767 | 4533.328 | 5714.684 | 3189.758 | 4374.947 | 4159.138 |
| 202 | 4404.678 | 3192.269 | 5236.605 | 5014.043 | 4750 | 1357.6 | 2509.116 | 4615.767 | 4533.328 | 5714.684 | 3187.694 | 4374.027 | 4159.138 |
| 203 | 4404.249 | 3189.618 | 5236.605 | 5014.043 | 4750 | 1357.6 | 2504.89 | 4615.767 | 4533.328 | 5714.684 | 3185.862 | 4373.566 | 4159.138 |
| 204 | 4404.249 | 3186.971 | 5236.605 | 5014.043 | 4750 | 1357.6 | 2500.7 | 4615.767 | 4533.328 | 5714.684 | 3183.804 | 4372.646 | 4159.138 |
| 205 | 4403.82 | 3184.328 | 5236.605 | 5014.043 | 4750 | 1357.6 | 2496.543 | 4615.767 | 4533.328 | 5714.684 | 3181.976 | 4371.726 | 4159.138 |
| 206 | 4403.82 | 3181.69 | 5236.605 | 5014.043 | 4750 | 1357.6 | 2492.42 | 4615.767 | 4533.328 | 5714.684 | 3179.923 | 4371.266 | 4159.138 |
| 207 | 4403.82 | 3179.056 | 5236.605 | 5014.043 | 4750 | 1357.6 | 2488.331 | 4615.767 | 4533.328 | 5714.684 | 3177.872 | 4370.347 | 4159.138 |
| 208 | 4403.391 | 3176.427 | 5236.605 | 5014.043 | 4750 | 1357.6 | 2484.274 | 4615.767 | 4533.328 | 5714.684 | 3175.824 | 4369.887 | 4159.138 |
| 209 | 4403.391 | 3173.802 | 5236.605 | 5014.043 | 4750 | 1357.6 | 2480.25 | 4615.767 | 4533.328 | 5714.684 | 3173.778 | 4368.969 | 4159.138 |
| 210 | 4402.962 | 3171.181 | 5236.605 | 5014.043 | 4750 | 1357.6 | 2476.258 | 4615.767 | 4533.328 | 5714.684 | 3171.735 | 4368.05 | 4159.138 |
| 211 | 4402.962 | 3168.564 | 5236.605 | 5014.043 | 4750 | 1357.6 | 2472.298 | 4615.767 | 4533.328 | 5714.684 | 3169.468 | 4367.591 | 4159.138 |
| 212 | 4402.962 | 3165.952 | 5236.605 | 5014.043 | 4750 | 1357.6 | 2468.369 | 4615.767 | 4533.328 | 5714.684 | 3167.431 | 4366.674 | 4159.138 |
| 213 | 4402.533 | 3163.344 | 5236.605 | 5014.043 | 4750 | 1357.6 | 2464.47 | 4615.767 | 4533.328 | 5714.684 | 3165.396 | 4366.215 | 4159.138 |
| 214 | 4402.533 | 3160.741 | 5236.605 | 5014.043 | 4750 | 1357.6 | 2460.602 | 4615.767 | 4533.328 | 5714.684 | 3163.138 | 4365.298 | 4159.138 |
| 215 | 4402.104 | 3158.141 | 5236.605 | 5014.043 | 4750 | 1357.6 | 2456.764 | 4615.767 | 4533.328 | 5714.684 | 3160.884 | 4364.839 | 4159.138 |
| 216 | 4402.104 | 3155.546 | 5236.605 | 5014.043 | 4750 | 1357.6 | 2452.956 | 4615.767 | 4533.328 | 5714.684 | 3158.857 | 4363.923 | 4159.138 |
| 217 | 4402.104 | 3152.956 | 5236.605 | 5014.043 | 4750 | 1357.6 | 2449.177 | 4615.767 | 4533.328 | 5714.684 | 3156.609 | 4363.465 | 4159.138 |
| 218 | 4401.675 | 3150.369 | 5236.605 | 5014.043 | 4750 | 1357.6 | 2445.426 | 4615.767 | 4533.328 | 5714.684 | 3154.364 | 4362.549 | 4159.138 |
| 219 | 4401.675 | 3147.787 | 5236.605 | 5014.043 | 4750 | 1357.6 | 2441.705 | 4615.767 | 4533.328 | 5714.684 | 3152.122 | 4361.633 | 4159.138 |
| 220 | 4401.675 | 3145.209 | 5236.605 | 5014.043 | 4750 | 1357.6 | 2438.011 | 4615.767 | 4533.328 | 5714.684 | 3149.883 | 4361.175 | 4159.138 |
| 221 | 4401.247 | 3142.635 | 5236.605 | 5014.043 | 4750 | 1357.6 | 2434.345 | 4615.767 | 4533.328 | 5714.684 | 3147.647 | 4360.26 | 4159.138 |
| 222 | 4401.247 | 3140.065 | 5236.605 | 5014.043 | 4750 | 1357.6 | 2430.706 | 4615.767 | 4533.328 | 5714.684 | 3145.191 | 4359.803 | 4159.138 |
| 223 | 4400.818 | 3137.5 | 5236.605 | 5014.043 | 4750 | 1357.6 | 2427.095 | 4615.767 | 4533.328 | 5714.684 | 3142.962 | 4358.888 | 4159.138 |
| 224 | 4400.818 | 3134.939 | 5236.605 | 5014.043 | 4750 | 1357.6 | 2423.51 | 4615.767 | 4533.328 | 5714.684 | 3140.514 | 4358.431 | 4159.138 |
| 225 | 4400.818 | 3132.382 | 5236.605 | 5014.043 | 4750 | 1357.6 | 2419.951 | 4615.767 | 4533.328 | 5714.684 | 3138.292 | 4357.974 | 4159.138 |
| 226 | 4400.389 | 3129.829 | 5236.605 | 5014.043 | 4750 | 1357.6 | 2416.419 | 4615.767 | 4533.328 | 5714.684 | 3135.851 | 4357.06 | 4159.138 |
| 227 | 4400.389 | 3127.28 | 5236.605 | 5014.043 | 4750 | 1357.6 | 2412.913 | 4615.767 | 4533.328 | 5714.684 | 3133.413 | 4356.604 | 4159.138 |
| 228 | 4400.389 | 3124.736 | 5236.605 | 5014.043 | 4750 | 1357.6 | 2409.431 | 4615.767 | 4533.328 | 5714.684 | 3131.201 | 4355.691 | 4159.138 |
| 229 | 4399.961 | 3122.195 | 5236.605 | 5014.043 | 4750 | 1357.6 | 2405.975 | 4615.767 | 4533.328 | 5714.684 | 3128.771 | 4355.234 | 4159.138 |
| 230 | 4399.961 | 3119.659 | 5236.605 | 5014.043 | 4750 | 1357.6 | 2402.544 | 4615.767 | 4533.328 | 5714.684 | 3126.345 | 4354.322 | 4159.138 |
| 231 | 4399.961 | 3117.127 | 5236.605 | 5014.043 | 4750 | 1357.6 | 2399.138 | 4615.767 | 4533.328 | 5714.684 | 3123.922 | 4353.865 | 4159.138 |
| 232 | 4399.533 | 3114.599 | 5236.605 | 5014.043 | 4750 | 1357.6 | 2395.755 | 4615.767 | 4533.328 | 5714.684 | 3121.503 | 4352.953 | 4159.138 |
| 233 | 4399.533 | 3112.075 | 5236.605 | 5014.043 | 4750 | 1357.6 | 2392.397 | 4615.767 | 4533.328 | 5714.684 | 3118.869 | 4352.498 | 4159.138 |
| 234 | 4399.533 | 3109.555 | 5236.605 | 5014.043 | 4750 | 1357.6 | 2389.062 | 4615.767 | 4533.328 | 5714.684 | 3116.458 | 4352.042 | 4159.138 |
| 235 | 4399.104 | 3107.039 | 5236.605 | 5014.043 | 4750 | 1357.6 | 2385.751 | 4615.767 | 4533.328 | 5714.684 | 3114.051 | 4351.131 | 4159.138 |
| 236 | 4399.104 | 3104.527 | 5236.605 | 5014.043 | 4750 | 1357.6 | 2382.462 | 4615.767 | 4533.328 | 5714.684 | 3111.429 | 4350.675 | 4159.138 |
| 237 | 4398.676 | 3102.019 | 5236.605 | 5014.043 | 4750 | 1357.6 | 2379.197 | 4615.767 | 4533.328 | 5714.684 | 3109.03 | 4349.765 | 4159.138 |
| 238 | 4398.676 | 3099.516 | 5236.605 | 5014.043 | 4750 | 1357.6 | 2375.954 | 4615.767 | 4533.328 | 5714.684 | 3106.416 | 4349.309 | 4159.138 |
| 239 | 4398.676 | 3097.016 | 5236.605 | 5014.043 | 4750 | 1357.6 | 2372.734 | 4615.767 | 4533.328 | 5714.684 | 3104.025 | 4348.399 | 4159.138 |
| 240 | 4398.248 | 3094.521 | 5236.605 | 5014.043 | 4750 | 1357.6 | 2369.535 | 4615.767 | 4533.328 | 5714.684 | 3101.42 | 4347.944 | 4159.138 |
| 241 | 4398.248 | 3092.029 | 5236.605 | 5014.043 | 4750 | 1357.6 | 2366.358 | 4615.767 | 4533.328 | 5714.684 | 3098.819 | 4347.49 | 4159.138 |
| 242 | 4398.248 | 3089.541 | 5236.605 | 5014.043 | 4750 | 1357.6 | 2363.203 | 4615.767 | 4533.328 | 5714.684 | 3096.439 | 4346.58 | 4159.138 |
| 243 | 4397.82 | 3087.058 | 5236.605 | 5014.043 | 4750 | 1357.6 | 2360.069 | 4615.767 | 4533.328 | 5714.684 | 3093.847 | 4346.126 | 4159.138 |
| 244 | 4397.82 | 3084.578 | 5236.605 | 5014.043 | 4750 | 1357.6 | 2356.957 | 4615.767 | 4533.328 | 5714.684 | 3091.259 | 4345.671 | 4159.138 |
| 245 | 4397.82 | 3082.103 | 5236.605 | 5014.043 | 4750 | 1357.6 | 2353.865 | 4615.767 | 4533.328 | 5714.684 | 3088.675 | 4344.763 | 4159.138 |
| 246 | 4397.392 | 3079.631 | 5236.605 | 5014.043 | 4750 | 1357.6 | 2350.793 | 4615.767 | 4533.328 | 5714.684 | 3086.096 | 4344.309 | 4159.138 |
| 247 | 4397.392 | 3077.163 | 5236.605 | 5014.043 | 4750 | 1357.6 | 2347.742 | 4615.767 | 4533.328 | 5714.684 | 3083.521 | 4343.855 | 4159.138 |
| 248 | 4397.392 | 3074.7 | 5236.605 | 5014.043 | 4750 | 1357.6 | 2344.712 | 4615.767 | 4533.328 | 5714.684 | 3081.164 | 4342.947 | 4159.138 |
| 249 | 4396.964 | 3072.24 | 5236.605 | 5014.043 | 4750 | 1357.6 | 2341.701 | 4615.767 | 4533.328 | 5714.684 | 3078.598 | 4342.493 | 4159.138 |
| 250 | 4396.964 | 3069.784 | 5236.605 | 5014.043 | 4750 | 1357.6 | 2338.709 | 4615.767 | 4533.328 | 5714.684 | 3076.035 | 4342.039 | 4159.138 |
| 251 | 4396.964 | 3067.332 | 5236.605 | 5014.043 | 4750 | 1357.6 | 2335.738 | 4615.767 | 4533.328 | 5714.684 | 3073.477 | 4341.132 | 4159.138 |
| 252 | 4396.537 | 3064.884 | 5236.605 | 5014.043 | 4750 | 1357.6 | 2332.785 | 4615.767 | 4533.328 | 5714.684 | 3070.923 | 4340.679 | 4159.138 |
| 253 | 4396.537 | 3062.44 | 5236.605 | 5014.043 | 4750 | 1357.6 | 2329.852 | 4615.767 | 4533.328 | 5714.684 | 3068.373 | 4340.226 | 4159.138 |
| 254 | 4396.537 | 3060 | 5236.605 | 5014.043 | 4750 | 1357.6 | 2326.937 | 4615.767 | 4533.328 | 5714.684 | 3066.04 | 4339.319 | 4159.138 |
| 255 | 4396.109 | 3057.564 | 5236.605 | 5014.043 | 4750 | 1357.6 | 2324.041 | 4615.767 | 4533.328 | 5714.684 | 3063.498 | 4338.866 | 4159.138 |
| 256 | 4396.109 | 3055.131 | 5236.605 | 5014.043 | 4750 | 1357.6 | 2321.164 | 4615.767 | 4533.328 | 5714.684 | 3060.961 | 4338.413 | 4159.138 |
| 257 | 4396.109 | 3052.703 | 5236.605 | 5014.043 | 4750 | 1357.6 | 2318.305 | 4615.767 | 4533.328 | 5714.684 | 3058.428 | 4337.508 | 4159.138 |
| 258 | 4396.109 | 3050.278 | 5236.605 | 5014.043 | 4750 | 1357.6 | 2315.463 | 4615.767 | 4533.328 | 5714.684 | 3056.109 | 4337.055 | 4159.138 |
| 259 | 4395.681 | 3047.857 | 5236.605 | 5014.043 | 4750 | 1357.6 | 2312.64 | 4615.767 | 4533.328 | 5714.684 | 3053.584 | 4336.603 | 4159.138 |
| 260 | 4395.681 | 3045.44 | 5236.605 | 5014.043 | 4750 | 1357.6 | 2309.834 | 4615.767 | 4533.328 | 5714.684 | 3051.273 | 4336.15 | 4159.138 |
| 261 | 4395.681 | 3043.027 | 5236.605 | 5014.043 | 4750 | 1357.6 | 2307.046 | 4615.767 | 4533.328 | 5714.684 | 3048.756 | 4335.246 | 4159.138 |
| 262 | 4395.254 | 3040.618 | 5236.605 | 5014.043 | 4750 | 1357.6 | 2304.276 | 4615.767 | 4533.328 | 5714.684 | 3046.452 | 4334.793 | 4159.138 |
| 263 | 4395.254 | 3038.212 | 5236.605 | 5014.043 | 4750 | 1357.6 | 2301.522 | 4615.767 | 4533.328 | 5714.684 | 3044.152 | 4334.341 | 4159.138 |
| 264 | 4395.254 | 3035.81 | 5236.605 | 5014.043 | 4750 | 1357.6 | 2298.785 | 4615.767 | 4533.328 | 5714.684 | 3041.855 | 4333.438 | 4159.138 |
| 265 | 4394.826 | 3033.412 | 5236.605 | 5014.043 | 4750 | 1357.6 | 2296.065 | 4615.767 | 4533.328 | 5714.684 | 3039.561 | 4332.986 | 4159.138 |
| 266 | 4394.826 | 3031.018 | 5236.605 | 5014.043 | 4750 | 1357.6 | 2293.362 | 4615.767 | 4533.328 | 5714.684 | 3037.271 | 4332.534 | 4159.138 |
| 267 | 4394.826 | 3028.628 | 5236.605 | 5014.043 | 4750 | 1357.6 | 2290.675 | 4615.767 | 4533.328 | 5714.684 | 3035.193 | 4332.083 | 4159.138 |
| 268 | 4394.399 | 3026.241 | 5236.605 | 5014.043 | 4750 | 1357.6 | 2288.004 | 4615.767 | 4533.328 | 5714.684 | 3032.909 | 4331.631 | 4159.138 |
| 269 | 4394.399 | 3023.858 | 5236.605 | 5014.043 | 4750 | 1357.6 | 2285.349 | 4615.767 | 4533.328 | 5714.684 | 3030.837 | 4330.728 | 4159.138 |
| 270 | 4394.399 | 3021.479 | 5236.605 | 5014.043 | 4750 | 1357.6 | 2282.711 | 4615.767 | 4533.328 | 5714.684 | 3028.767 | 4330.277 | 4159.138 |
| 271 | 4393.972 | 3019.104 | 5236.605 | 5014.043 | 4750 | 1357.6 | 2280.088 | 4615.767 | 4533.328 | 5714.684 | 3026.699 | 4329.826 | 4159.138 |
| 272 | 4393.972 | 3016.732 | 5236.605 | 5014.043 | 4750 | 1357.6 | 2277.481 | 4615.767 | 4533.328 | 5714.684 | 3024.635 | 4329.375 | 4159.138 |
| 273 | 4393.972 | 3014.364 | 5236.605 | 5014.043 | 4750 | 1357.6 | 2274.889 | 4615.767 | 4533.328 | 5714.684 | 3022.574 | 4328.473 | 4159.138 |
| 274 | 4393.972 | 3012 | 5236.605 | 5014.043 | 4750 | 1357.6 | 2272.312 | 4615.767 | 4533.328 | 5714.684 | 3020.721 | 4328.022 | 4159.138 |
| 275 | 4393.545 | 3009.639 | 5236.605 | 5014.043 | 4750 | 1357.6 | 2269.751 | 4615.767 | 4533.328 | 5714.684 | 3018.87 | 4327.572 | 4159.138 |
| 276 | 4393.545 | 3007.283 | 5236.605 | 5014.043 | 4750 | 1357.6 | 2267.204 | 4615.767 | 4533.328 | 5714.684 | 3017.022 | 4327.121 | 4159.138 |
| 277 | 4393.545 | 3004.93 | 5236.605 | 5014.043 | 4750 | 1357.6 | 2264.673 | 4615.767 | 4533.328 | 5714.684 | 3015.175 | 4326.671 | 4159.138 |
| 278 | 4393.118 | 3002.58 | 5236.605 | 5014.043 | 4750 | 1357.6 | 2262.156 | 4615.767 | 4533.328 | 5714.684 | 3013.536 | 4325.77 | 4159.138 |
| 279 | 4393.118 | 3000.234 | 5236.605 | 5014.043 | 4750 | 1357.6 | 2259.654 | 4615.767 | 4533.328 | 5714.684 | 3011.899 | 4325.32 | 4159.138 |
| 280 | 4393.118 | 2997.892 | 5236.605 | 5014.043 | 4750 | 1357.6 | 2257.166 | 4615.767 | 4533.328 | 5714.684 | 3010.263 | 4324.87 | 4159.138 |
| 281 | 4393.118 | 2995.554 | 5236.605 | 5014.043 | 4750 | 1357.6 | 2254.692 | 4615.767 | 4533.328 | 5714.684 | 3008.834 | 4324.42 | 4159.138 |
| 282 | 4392.691 | 2993.219 | 5236.605 | 5014.043 | 4750 | 1357.6 | 2252.233 | 4615.767 | 4533.328 | 5714.684 | 3007.405 | 4323.97 | 4159.138 |
| 283 | 4392.691 | 2990.888 | 5236.605 | 5014.043 | 4750 | 1357.6 | 2249.788 | 4615.767 | 4533.328 | 5714.684 | 3005.978 | 4323.071 | 4159.138 |
| 284 | 4392.691 | 2988.56 | 5236.605 | 5014.043 | 4750 | 1357.6 | 2247.356 | 4615.767 | 4533.328 | 5714.684 | 3004.756 | 4322.621 | 4159.138 |
| 285 | 4392.264 | 2986.236 | 5236.605 | 5014.043 | 4750 | 1357.6 | 2244.938 | 4615.767 | 4533.328 | 5714.684 | 3003.535 | 4322.171 | 4159.138 |
| 286 | 4392.264 | 2983.916 | 5236.605 | 5014.043 | 4750 | 1357.6 | 2242.534 | 4615.767 | 4533.328 | 5714.684 | 3002.315 | 4321.722 | 4159.138 |
| 287 | 4392.264 | 2981.599 | 5236.605 | 5014.043 | 4750 | 1357.6 | 2240.143 | 4615.767 | 4533.328 | 5714.684 | 3001.299 | 4321.273 | 4159.138 |
| 288 | 4391.837 | 2979.286 | 5236.605 | 5014.043 | 4750 | 1357.6 | 2237.766 | 4615.767 | 4533.328 | 5714.684 | 3000.284 | 4320.823 | 4159.138 |
| 289 | 4391.837 | 2976.977 | 5236.605 | 5014.043 | 4750 | 1357.6 | 2235.402 | 4615.767 | 4533.328 | 5714.684 | 2999.472 | 4319.925 | 4159.138 |
| 290 | 4391.837 | 2974.671 | 5236.605 | 5014.043 | 4750 | 1357.6 | 2233.051 | 4615.767 | 4533.328 | 5714.684 | 2998.661 | 4319.476 | 4159.138 |
| 291 | 4391.837 | 2972.368 | 5236.605 | 5014.043 | 4750 | 1357.6 | 2230.713 | 4615.767 | 4533.328 | 5714.684 | 2998.053 | 4319.027 | 4159.138 |
| 292 | 4391.41 | 2970.07 | 5236.605 | 5014.043 | 4750 | 1357.6 | 2228.388 | 4615.767 | 4533.328 | 5714.684 | 2997.445 | 4318.579 | 4159.138 |
| 293 | 4391.41 | 2967.774 | 5236.605 | 5014.043 | 4750 | 1357.6 | 2226.075 | 4615.767 | 4533.328 | 5714.684 | 2997.04 | 4318.13 | 4159.138 |
| 294 | 4391.41 | 2965.483 | 5236.605 | 5014.043 | 4750 | 1357.6 | 2223.775 | 4615.767 | 4533.328 | 5714.684 | 2996.635 | 4317.681 | 4159.138 |
| 295 | 4391.41 | 2963.194 | 5236.605 | 5014.043 | 4750 | 1357.6 | 2221.488 | 4615.767 | 4533.328 | 5714.684 | 2996.432 | 4317.233 | 4159.138 |
| 296 | 4390.983 | 2960.91 | 5236.605 | 5014.043 | 4750 | 1357.6 | 2219.213 | 4615.767 | 4533.328 | 5714.684 | 2996.23 | 4316.784 | 4159.138 |
| 297 | 4390.983 | 2958.629 | 5236.605 | 5014.043 | 4750 | 1357.6 | 2216.951 | 4615.767 | 4533.328 | 5714.684 | 2996.23 | 4315.888 | 4159.138 |
| 298 | 4390.983 | 2956.351 | 5236.605 | 5014.043 | 4750 | 1357.6 | 2214.7 | 4615.767 | 4533.328 | 5714.684 | 2996.23 | 4315.44 | 4159.138 |
| 299 | 4390.557 | 2954.077 | 5236.605 | 5014.043 | 4750 | 1357.6 | 2212.462 | 4615.767 | 4533.328 | 5714.684 | 2996.23 | 4314.992 | 4159.138 |
| 300 | 4390.614 | 2951.806 | 5236.605 | 5014.043 | 4750 | 1357.6 | 2212.462 | 4615.767 | 4533.328 | 5714.684 | 2996.23 | 4314.544 | 4159.138 |
| 301 | 4390.497 | 2949.539 | 5236.605 | 5014.043 | 4750 | 1357.6 | 2212.462 | 4615.767 | 4533.328 | 5714.684 | 2996.23 | 4314.096 | 4159.138 |
| 302 | 4390.381 | 2947.276 | 5236.605 | 5014.043 | 4750 | 1357.6 | 2212.462 | 4615.767 | 4533.328 | 5714.684 | 2996.23 | 4313.648 | 4159.138 |
| 303 | 4390.265 | 2945.015 | 5236.605 | 5014.043 | 4750 | 1357.6 | 2212.462 | 4615.767 | 4533.328 | 5714.684 | 2996.23 | 4313.2 | 4159.138 |
| 304 | 4390.15 | 2942.759 | 5236.605 | 5014.043 | 4750 | 1357.6 | 2212.462 | 4615.767 | 4533.328 | 5714.684 | 2996.23 | 4312.753 | 4159.138 |
| 305 | 4390.035 | 2940.505 | 5236.605 | 5014.043 | 4750 | 1357.6 | 2212.462 | 4615.767 | 4533.328 | 5714.684 | 2996.23 | 4312.305 | 4159.138 |
| 306 | 4389.921 | 2938.256 | 5236.605 | 5014.043 | 4750 | 1357.6 | 2212.462 | 4615.767 | 4533.328 | 5714.684 | 2996.23 | 4311.411 | 4159.138 |
| 307 | 4389.806 | 2936.009 | 5236.605 | 5014.043 | 4750 | 1357.6 | 2212.462 | 4615.767 | 4533.328 | 5714.684 | 2996.23 | 4310.964 | 4159.138 |
| 308 | 4389.693 | 2933.766 | 5236.605 | 5014.043 | 4750 | 1357.6 | 2212.462 | 4615.767 | 4533.328 | 5714.684 | 2996.23 | 4310.516 | 4159.138 |
| 309 | 4389.579 | 2931.527 | 5236.605 | 5014.043 | 4750 | 1357.6 | 2212.462 | 4615.767 | 4533.328 | 5714.684 | 2996.23 | 4310.069 | 4159.138 |
| 310 | 4389.466 | 2929.291 | 5236.605 | 5014.043 | 4750 | 1357.6 | 2212.462 | 4615.767 | 4533.328 | 5714.684 | 2996.23 | 4309.623 | 4159.138 |
| 311 | 4389.354 | 2927.058 | 5236.605 | 5014.043 | 4750 | 1357.6 | 2212.462 | 4615.767 | 4533.328 | 5714.684 | 2996.23 | 4309.176 | 4159.138 |
| 312 | 4389.241 | 2924.829 | 5236.605 | 5014.043 | 4750 | 1357.6 | 2212.462 | 4615.767 | 4533.328 | 5714.684 | 2996.23 | 4308.729 | 4159.138 |
| 313 | 4389.129 | 2922.603 | 5236.605 | 5014.043 | 4750 | 1357.6 | 2212.462 | 4615.767 | 4533.328 | 5714.684 | 2996.23 | 4308.282 | 4159.138 |
| 314 | 4389.018 | 2920.38 | 5236.605 | 5014.043 | 4750 | 1357.6 | 2212.462 | 4615.767 | 4533.328 | 5714.684 | 2996.23 | 4307.836 | 4159.138 |
| 315 | 4388.906 | 2918.161 | 5236.605 | 5014.043 | 4750 | 1357.6 | 2212.462 | 4615.767 | 4533.328 | 5714.684 | 2996.23 | 4307.389 | 4159.138 |
| 316 | 4388.796 | 2915.945 | 5236.605 | 5014.043 | 4750 | 1357.6 | 2212.462 | 4615.767 | 4533.328 | 5714.684 | 2996.23 | 4306.943 | 4159.138 |
| 317 | 4388.685 | 2913.733 | 5236.605 | 5014.043 | 4750 | 1357.6 | 2212.462 | 4615.767 | 4533.328 | 5714.684 | 2996.23 | 4306.497 | 4159.138 |
| 318 | 4388.575 | 2911.524 | 5236.605 | 5014.043 | 4750 | 1357.6 | 2212.462 | 4615.767 | 4533.328 | 5714.684 | 2996.23 | 4306.051 | 4159.138 |
| 319 | 4388.465 | 2909.318 | 5236.605 | 5014.043 | 4750 | 1357.6 | 2212.462 | 4615.767 | 4533.328 | 5714.684 | 2996.23 | 4305.604 | 4159.138 |
| 320 | 4388.356 | 2907.116 | 5236.605 | 5014.043 | 4750 | 1357.6 | 2212.462 | 4615.767 | 4533.328 | 5714.684 | 2996.23 | 4305.158 | 4159.138 |
| 321 | 4388.246 | 2904.917 | 5236.605 | 5014.043 | 4750 | 1357.6 | 2212.462 | 4615.767 | 4533.328 | 5714.684 | 2996.23 | 4304.713 | 4159.138 |
| 322 | 4388.138 | 2902.721 | 5236.605 | 5014.043 | 4750 | 1357.6 | 2212.462 | 4615.767 | 4533.328 | 5714.684 | 2996.23 | 4304.267 | 4159.138 |
| 323 | 4388.029 | 2900.529 | 5236.605 | 5014.043 | 4750 | 1357.6 | 2212.462 | 4615.767 | 4533.328 | 5714.684 | 2996.23 | 4303.821 | 4159.138 |
| 324 | 4387.921 | 2898.34 | 5236.605 | 5014.043 | 4750 | 1357.6 | 2212.462 | 4615.767 | 4533.328 | 5714.684 | 2996.23 | 4303.375 | 4159.138 |
| 325 | 4387.813 | 2896.154 | 5236.605 | 5014.043 | 4750 | 1357.6 | 2212.462 | 4615.767 | 4533.328 | 5714.684 | 2996.23 | 4302.484 | 4159.138 |
| 326 | 4387.706 | 2893.971 | 5236.605 | 5014.043 | 4750 | 1357.6 | 2212.462 | 4615.767 | 4533.328 | 5714.684 | 2996.23 | 4302.039 | 4159.138 |
| 327 | 4387.599 | 2891.792 | 5236.605 | 5014.043 | 4750 | 1357.6 | 2212.462 | 4615.767 | 4533.328 | 5714.684 | 2996.23 | 4301.594 | 4159.138 |
| 328 | 4387.492 | 2889.616 | 5236.605 | 5014.043 | 4750 | 1357.6 | 2212.462 | 4615.767 | 4533.328 | 5714.684 | 2996.23 | 4301.149 | 4159.138 |
| 329 | 4387.386 | 2887.444 | 5236.605 | 5014.043 | 4750 | 1357.6 | 2212.462 | 4615.767 | 4533.328 | 5714.684 | 2996.23 | 4300.704 | 4159.138 |
| 330 | 4387.28 | 2885.274 | 5236.605 | 5014.043 | 4750 | 1357.6 | 2212.462 | 4615.767 | 4533.328 | 5714.684 | 2996.23 | 4300.259 | 4159.138 |
| 331 | 4387.174 | 2883.108 | 5236.605 | 5014.043 | 4750 | 1357.6 | 2212.462 | 4615.767 | 4533.328 | 5714.684 | 2996.23 | 4299.814 | 4159.138 |
| 332 | 4387.068 | 2880.945 | 5236.605 | 5014.043 | 4750 | 1357.6 | 2212.462 | 4615.767 | 4533.328 | 5714.684 | 2996.23 | 4299.369 | 4159.138 |
| 333 | 4386.963 | 2878.786 | 5236.605 | 5014.043 | 4750 | 1357.6 | 2212.462 | 4615.767 | 4533.328 | 5714.684 | 2996.23 | 4298.924 | 4159.138 |
| 334 | 4386.858 | 2876.629 | 5236.605 | 5014.043 | 4750 | 1357.6 | 2212.462 | 4615.767 | 4533.328 | 5714.684 | 2996.23 | 4298.48 | 4159.138 |
| 335 | 4386.754 | 2874.476 | 5236.605 | 5014.043 | 4750 | 1357.6 | 2212.462 | 4615.767 | 4533.328 | 5714.684 | 2996.23 | 4298.035 | 4159.138 |
| 336 | 4386.65 | 2872.326 | 5236.605 | 5014.043 | 4750 | 1357.6 | 2212.462 | 4615.767 | 4533.328 | 5714.684 | 2996.23 | 4297.591 | 4159.138 |
| 337 | 4386.546 | 2870.179 | 5236.605 | 5014.043 | 4750 | 1357.6 | 2212.462 | 4615.767 | 4533.328 | 5714.684 | 2996.23 | 4297.146 | 4159.138 |
| 338 | 4386.442 | 2868.036 | 5236.605 | 5014.043 | 4750 | 1357.6 | 2212.462 | 4615.767 | 4533.328 | 5714.684 | 2996.23 | 4296.702 | 4159.138 |
| 339 | 4386.339 | 2865.896 | 5236.605 | 5014.043 | 4750 | 1357.6 | 2212.462 | 4615.767 | 4533.328 | 5714.684 | 2996.23 | 4296.258 | 4159.138 |
| 340 | 4386.236 | 2863.758 | 5236.605 | 5014.043 | 4750 | 1357.6 | 2212.462 | 4615.767 | 4533.328 | 5714.684 | 2996.23 | 4296.258 | 4159.138 |
| 341 | 4386.133 | 2861.624 | 5236.605 | 5014.043 | 4750 | 1357.6 | 2212.462 | 4615.767 | 4533.328 | 5714.684 | 2996.23 | 4295.814 | 4159.138 |
| 342 | 4386.031 | 2859.494 | 5236.605 | 5014.043 | 4750 | 1357.6 | 2212.462 | 4615.767 | 4533.328 | 5714.684 | 2996.23 | 4295.37 | 4159.138 |
| 343 | 4385.929 | 2857.366 | 5236.605 | 5014.043 | 4750 | 1357.6 | 2212.462 | 4615.767 | 4533.328 | 5714.684 | 2996.23 | 4294.926 | 4159.138 |
| 344 | 4385.827 | 2855.242 | 5236.605 | 5014.043 | 4750 | 1357.6 | 2212.462 | 4615.767 | 4533.328 | 5714.684 | 2996.23 | 4294.482 | 4159.138 |
| 345 | 4385.726 | 2853.12 | 5236.605 | 5014.043 | 4750 | 1357.6 | 2212.462 | 4615.767 | 4533.328 | 5714.684 | 2996.23 | 4294.039 | 4159.138 |
| 346 | 4385.625 | 2851.002 | 5236.605 | 5014.043 | 4750 | 1357.6 | 2212.462 | 4615.767 | 4533.328 | 5714.684 | 2996.23 | 4293.595 | 4159.138 |
| 347 | 4385.524 | 2848.887 | 5236.605 | 5014.043 | 4750 | 1357.6 | 2212.462 | 4615.767 | 4533.328 | 5714.684 | 2996.23 | 4293.152 | 4159.138 |
| 348 | 4385.424 | 2846.775 | 5236.605 | 5014.043 | 4750 | 1357.6 | 2212.462 | 4615.767 | 4533.328 | 5714.684 | 2996.23 | 4292.708 | 4159.138 |
| 349 | 4385.323 | 2844.667 | 5236.605 | 5014.043 | 4750 | 1357.6 | 2212.462 | 4615.767 | 4533.328 | 5714.684 | 2996.23 | 4292.265 | 4159.138 |
| 350 | 4385.223 | 2842.561 | 5236.605 | 5014.043 | 4750 | 1357.6 | 2212.462 | 4615.767 | 4533.328 | 5714.684 | 2996.23 | 4291.822 | 4159.138 |
| 351 | 4385.124 | 2840.459 | 5236.605 | 5014.043 | 4750 | 1357.6 | 2212.462 | 4615.767 | 4533.328 | 5714.684 | 2996.23 | 4291.378 | 4159.138 |
| 352 | 4385.024 | 2838.359 | 5236.605 | 5014.043 | 4750 | 1357.6 | 2212.462 | 4615.767 | 4533.328 | 5714.684 | 2996.23 | 4290.935 | 4159.138 |
| 353 | 4384.925 | 2836.263 | 5236.605 | 5014.043 | 4750 | 1357.6 | 2212.462 | 4615.767 | 4533.328 | 5714.684 | 2996.23 | 4290.492 | 4159.138 |
| 354 | 4384.826 | 2834.17 | 5236.605 | 5014.043 | 4750 | 1357.6 | 2212.462 | 4615.767 | 4533.328 | 5714.684 | 2996.23 | 4290.05 | 4159.138 |
| 355 | 4384.728 | 2832.08 | 5236.605 | 5014.043 | 4750 | 1357.6 | 2212.462 | 4615.767 | 4533.328 | 5714.684 | 2996.23 | 4289.607 | 4159.138 |
| 356 | 4384.63 | 2829.993 | 5236.605 | 5014.043 | 4750 | 1357.6 | 2212.462 | 4615.767 | 4533.328 | 5714.684 | 2996.23 | 4289.164 | 4159.138 |
| 357 | 4384.532 | 2827.909 | 5236.605 | 5014.043 | 4750 | 1357.6 | 2212.462 | 4615.767 | 4533.328 | 5714.684 | 2996.23 | 4288.721 | 4159.138 |
| 358 | 4384.434 | 2825.828 | 5236.605 | 5014.043 | 4750 | 1357.6 | 2212.462 | 4615.767 | 4533.328 | 5714.684 | 2996.23 | 4288.279 | 4159.138 |
| 359 | 4384.337 | 2823.75 | 5236.605 | 5014.043 | 4750 | 1357.6 | 2212.462 | 4615.767 | 4533.328 | 5714.684 | 2996.23 | 4287.837 | 4159.138 |
| 360 | 4384.239 | 2821.675 | 5236.605 | 5014.043 | 4750 | 1357.6 | 2212.462 | 4615.767 | 4533.328 | 5714.684 | 2996.23 | 4287.837 | 4159.138 |
| 361 | 4384.143 | 2819.604 | 5236.605 | 5014.043 | 4750 | 1357.6 | 2212.462 | 4615.767 | 4533.328 | 5714.684 | 2996.23 | 4287.394 | 4159.138 |
| 362 | 4384.046 | 2817.535 | 5236.605 | 5014.043 | 4750 | 1357.6 | 2212.462 | 4615.767 | 4533.328 | 5714.684 | 2996.23 | 4286.952 | 4159.138 |
| 363 | 4383.95 | 2815.469 | 5236.605 | 5014.043 | 4750 | 1357.6 | 2212.462 | 4615.767 | 4533.328 | 5714.684 | 2996.23 | 4286.51 | 4159.138 |
| 364 | 4383.854 | 2813.407 | 5236.605 | 5014.043 | 4750 | 1357.6 | 2212.462 | 4615.767 | 4533.328 | 5714.684 | 2996.23 | 4286.068 | 4159.138 |
| 365 | 4383.758 | 2811.347 | 5236.605 | 5014.043 | 4750 | 1357.6 | 2212.462 | 4615.767 | 4533.328 | 5714.684 | 2996.23 | 4285.626 | 4159.138 |
| 366 | 4383.662 | 2809.29 | 5236.605 | 5014.043 | 4750 | 1357.6 | 2212.462 | 4615.767 | 4533.328 | 5714.684 | 2996.23 | 4285.184 | 4159.138 |
| 367 | 4383.567 | 2807.237 | 5236.605 | 5014.043 | 4750 | 1357.6 | 2212.462 | 4615.767 | 4533.328 | 5714.684 | 2996.23 | 4284.742 | 4159.138 |
| 368 | 4383.472 | 2805.186 | 5236.605 | 5014.043 | 4750 | 1357.6 | 2212.462 | 4615.767 | 4533.328 | 5714.684 | 2996.23 | 4284.301 | 4159.138 |
| 369 | 4383.377 | 2803.139 | 5236.605 | 5014.043 | 4750 | 1357.6 | 2212.462 | 4615.767 | 4533.328 | 5714.684 | 2996.23 | 4283.859 | 4159.138 |
| 370 | 4383.283 | 2801.094 | 5236.605 | 5014.043 | 4750 | 1357.6 | 2212.462 | 4615.767 | 4533.328 | 5714.684 | 2996.23 | 4283.417 | 4159.138 |
| 371 | 4383.189 | 2799.052 | 5236.605 | 5014.043 | 4750 | 1357.6 | 2212.462 | 4615.767 | 4533.328 | 5714.684 | 2996.23 | 4283.417 | 4159.138 |
| 372 | 4383.095 | 2797.014 | 5236.605 | 5014.043 | 4750 | 1357.6 | 2212.462 | 4615.767 | 4533.328 | 5714.684 | 2996.23 | 4282.976 | 4159.138 |
| 373 | 4383.001 | 2794.978 | 5236.605 | 5014.043 | 4750 | 1357.6 | 2212.462 | 4615.767 | 4533.328 | 5714.684 | 2996.23 | 4282.535 | 4159.138 |
| 374 | 4382.907 | 2792.945 | 5236.605 | 5014.043 | 4750 | 1357.6 | 2212.462 | 4615.767 | 4533.328 | 5714.684 | 2996.23 | 4282.094 | 4159.138 |
| 375 | 4382.814 | 2790.916 | 5236.605 | 5014.043 | 4750 | 1357.6 | 2212.462 | 4615.767 | 4533.328 | 5714.684 | 2996.23 | 4281.652 | 4159.138 |
| 376 | 4382.721 | 2788.889 | 5236.605 | 5014.043 | 4750 | 1357.6 | 2212.462 | 4615.767 | 4533.328 | 5714.684 | 2996.23 | 4281.211 | 4159.138 |
| 377 | 4382.629 | 2786.865 | 5236.605 | 5014.043 | 4750 | 1357.6 | 2212.462 | 4615.767 | 4533.328 | 5714.684 | 2996.23 | 4280.77 | 4159.138 |
| 378 | 4382.536 | 2784.844 | 5236.605 | 5014.043 | 4750 | 1357.6 | 2212.462 | 4615.767 | 4533.328 | 5714.684 | 2996.23 | 4280.33 | 4159.138 |
| 379 | 4382.444 | 2782.826 | 5236.605 | 5014.043 | 4750 | 1357.6 | 2212.462 | 4615.767 | 4533.328 | 5714.684 | 2996.23 | 4279.889 | 4159.138 |
| 380 | 4382.352 | 2780.811 | 5236.605 | 5014.043 | 4750 | 1357.6 | 2212.462 | 4615.767 | 4533.328 | 5714.684 | 2996.23 | 4279.889 | 4159.138 |
| 381 | 4382.26 | 2778.799 | 5236.605 | 5014.043 | 4750 | 1357.6 | 2212.462 | 4615.767 | 4533.328 | 5714.684 | 2996.23 | 4279.448 | 4159.138 |
| 382 | 4382.169 | 2776.79 | 5236.605 | 5014.043 | 4750 | 1357.6 | 2212.462 | 4615.767 | 4533.328 | 5714.684 | 2996.23 | 4279.008 | 4159.138 |
| 383 | 4382.078 | 2774.783 | 5236.605 | 5014.043 | 4750 | 1357.6 | 2212.462 | 4615.767 | 4533.328 | 5714.684 | 2996.23 | 4278.567 | 4159.138 |
| 384 | 4381.987 | 2772.78 | 5236.605 | 5014.043 | 4750 | 1357.6 | 2212.462 | 4615.767 | 4533.328 | 5714.684 | 2996.23 | 4278.127 | 4159.138 |
| 385 | 4381.896 | 2770.779 | 5236.605 | 5014.043 | 4750 | 1357.6 | 2212.462 | 4615.767 | 4533.328 | 5714.684 | 2996.23 | 4277.686 | 4159.138 |
| 386 | 4381.805 | 2768.782 | 5236.605 | 5014.043 | 4750 | 1357.6 | 2212.462 | 4615.767 | 4533.328 | 5714.684 | 2996.23 | 4277.246 | 4159.138 |
| 387 | 4381.715 | 2766.787 | 5236.605 | 5014.043 | 4750 | 1357.6 | 2212.462 | 4615.767 | 4533.328 | 5714.684 | 2996.23 | 4277.246 | 4159.138 |
| 388 | 4381.625 | 2764.795 | 5236.605 | 5014.043 | 4750 | 1357.6 | 2212.462 | 4615.767 | 4533.328 | 5714.684 | 2996.23 | 4276.806 | 4159.138 |
| 389 | 4381.535 | 2762.806 | 5236.605 | 5014.043 | 4750 | 1357.6 | 2212.462 | 4615.767 | 4533.328 | 5714.684 | 2996.23 | 4276.366 | 4159.138 |
| 390 | 4381.446 | 2760.82 | 5236.605 | 5014.043 | 4750 | 1357.6 | 2212.462 | 4615.767 | 4533.328 | 5714.684 | 2996.23 | 4275.926 | 4159.138 |
| 391 | 4381.356 | 2758.836 | 5236.605 | 5014.043 | 4750 | 1357.6 | 2212.462 | 4615.767 | 4533.328 | 5714.684 | 2996.23 | 4275.486 | 4159.138 |
| 392 | 4381.267 | 2756.856 | 5236.605 | 5014.043 | 4750 | 1357.6 | 2212.462 | 4615.767 | 4533.328 | 5714.684 | 2996.23 | 4275.046 | 4159.138 |
| 393 | 4381.178 | 2754.878 | 5236.605 | 5014.043 | 4750 | 1357.6 | 2212.462 | 4615.767 | 4533.328 | 5714.684 | 2996.23 | 4274.607 | 4159.138 |
| 394 | 4381.09 | 2752.903 | 5236.605 | 5014.043 | 4750 | 1357.6 | 2212.462 | 4615.767 | 4533.328 | 5714.684 | 2996.23 | 4274.607 | 4159.138 |
| 395 | 4381.001 | 2750.931 | 5236.605 | 5014.043 | 4750 | 1357.6 | 2212.462 | 4615.767 | 4533.328 | 5714.684 | 2996.23 | 4274.167 | 4159.138 |
| 396 | 4380.913 | 2748.962 | 5236.605 | 5014.043 | 4750 | 1357.6 | 2212.462 | 4615.767 | 4533.328 | 5714.684 | 2996.23 | 4273.728 | 4159.138 |
| 397 | 4380.825 | 2746.996 | 5236.605 | 5014.043 | 4750 | 1357.6 | 2212.462 | 4615.767 | 4533.328 | 5714.684 | 2996.23 | 4273.288 | 4159.138 |
| 398 | 4380.738 | 2745.032 | 5236.605 | 5014.043 | 4750 | 1357.6 | 2212.462 | 4615.767 | 4533.328 | 5714.684 | 2996.23 | 4272.849 | 4159.138 |
| 399 | 4380.65 | 2743.071 | 5236.605 | 5014.043 | 4750 | 1357.6 | 2212.462 | 4615.767 | 4533.328 | 5714.684 | 2996.23 | 4272.41 | 4159.138 |
| 400 | 4380.563 | 2741.113 | 5236.605 | 5014.043 | 4750 | 1357.6 | 2212.462 | 4615.767 | 4533.328 | 5714.684 | 2996.23 | 4272.41 | 4159.138 |
| 401 | 4380.476 | 2739.158 | 5236.605 | 5014.043 | 4750 | 1357.6 | 2212.462 | 4615.767 | 4533.328 | 5714.684 | 2996.23 | 4271.97 | 4159.138 |
| 402 | 4380.389 | 2737.206 | 5236.605 | 5014.043 | 4750 | 1357.6 | 2212.462 | 4615.767 | 4533.328 | 5714.684 | 2996.23 | 4271.531 | 4159.138 |
| 403 | 4380.302 | 2735.256 | 5236.605 | 5014.043 | 4750 | 1357.6 | 2212.462 | 4615.767 | 4533.328 | 5714.684 | 2996.23 | 4271.092 | 4159.138 |
| 404 | 4380.216 | 2733.31 | 5236.605 | 5014.043 | 4750 | 1357.6 | 2212.462 | 4615.767 | 4533.328 | 5714.684 | 2996.23 | 4270.654 | 4159.138 |
| 405 | 4380.13 | 2731.366 | 5236.605 | 5014.043 | 4750 | 1357.6 | 2212.462 | 4615.767 | 4533.328 | 5714.684 | 2996.23 | 4270.215 | 4159.138 |
| 406 | 4380.044 | 2729.424 | 5236.605 | 5014.043 | 4750 | 1357.6 | 2212.462 | 4615.767 | 4533.328 | 5714.684 | 2996.23 | 4270.215 | 4159.138 |
| 407 | 4379.958 | 2727.486 | 5236.605 | 5014.043 | 4750 | 1357.6 | 2212.462 | 4615.767 | 4533.328 | 5714.684 | 2996.23 | 4269.776 | 4159.138 |
| 408 | 4379.872 | 2725.55 | 5236.605 | 5014.043 | 4750 | 1357.6 | 2212.462 | 4615.767 | 4533.328 | 5714.684 | 2996.23 | 4269.337 | 4159.138 |
| 409 | 4379.787 | 2723.617 | 5236.605 | 5014.043 | 4750 | 1357.6 | 2212.462 | 4615.767 | 4533.328 | 5714.684 | 2996.23 | 4268.899 | 4159.138 |
| 410 | 4379.702 | 2721.687 | 5236.605 | 5014.043 | 4750 | 1357.6 | 2212.462 | 4615.767 | 4533.328 | 5714.684 | 2996.23 | 4268.461 | 4159.138 |
| 411 | 4379.617 | 2719.759 | 5236.605 | 5014.043 | 4750 | 1357.6 | 2212.462 | 4615.767 | 4533.328 | 5714.684 | 2996.23 | 4268.461 | 4159.138 |
| 412 | 4379.532 | 2717.834 | 5236.605 | 5014.043 | 4750 | 1357.6 | 2212.462 | 4615.767 | 4533.328 | 5714.684 | 2996.23 | 4268.022 | 4159.138 |
| 413 | 4379.448 | 2715.912 | 5236.605 | 5014.043 | 4750 | 1357.6 | 2212.462 | 4615.767 | 4533.328 | 5714.684 | 2996.23 | 4267.584 | 4159.138 |
| 414 | 4379.363 | 2713.993 | 5236.605 | 5014.043 | 4750 | 1357.6 | 2212.462 | 4615.767 | 4533.328 | 5714.684 | 2996.23 | 4267.146 | 4159.138 |
| 415 | 4379.279 | 2712.076 | 5236.605 | 5014.043 | 4750 | 1357.6 | 2212.462 | 4615.767 | 4533.328 | 5714.684 | 2996.23 | 4266.708 | 4159.138 |
| 416 | 4379.195 | 2710.162 | 5236.605 | 5014.043 | 4750 | 1357.6 | 2212.462 | 4615.767 | 4533.328 | 5714.684 | 2996.23 | 4266.708 | 4159.138 |
| 417 | 4379.112 | 2708.251 | 5236.605 | 5014.043 | 4750 | 1357.6 | 2212.462 | 4615.767 | 4533.328 | 5714.684 | 2996.23 | 4266.27 | 4159.138 |
| 418 | 4379.028 | 2706.342 | 5236.605 | 5014.043 | 4750 | 1357.6 | 2212.462 | 4615.767 | 4533.328 | 5714.684 | 2996.23 | 4265.832 | 4159.138 |
| 419 | 4378.945 | 2704.437 | 5236.605 | 5014.043 | 4750 | 1357.6 | 2212.462 | 4615.767 | 4533.328 | 5714.684 | 2996.23 | 4265.394 | 4159.138 |
| 420 | 4378.862 | 2702.533 | 5236.605 | 5014.043 | 4750 | 1357.6 | 2212.462 | 4615.767 | 4533.328 | 5714.684 | 2996.23 | 4264.956 | 4159.138 |
| 421 | 4378.779 | 2700.633 | 5236.605 | 5014.043 | 4750 | 1357.6 | 2212.462 | 4615.767 | 4533.328 | 5714.684 | 2996.23 | 4264.956 | 4159.138 |
| 422 | 4378.696 | 2698.735 | 5236.605 | 5014.043 | 4750 | 1357.6 | 2212.462 | 4615.767 | 4533.328 | 5714.684 | 2996.23 | 4264.519 | 4159.138 |
| 423 | 4378.614 | 2696.84 | 5236.605 | 5014.043 | 4750 | 1357.6 | 2212.462 | 4615.767 | 4533.328 | 5714.684 | 2996.23 | 4264.081 | 4159.138 |
| 424 | 4378.532 | 2694.947 | 5236.605 | 5014.043 | 4750 | 1357.6 | 2212.462 | 4615.767 | 4533.328 | 5714.684 | 2996.23 | 4263.644 | 4159.138 |
| 425 | 4378.449 | 2693.058 | 5236.605 | 5014.043 | 4750 | 1357.6 | 2212.462 | 4615.767 | 4533.328 | 5714.684 | 2996.23 | 4263.206 | 4159.138 |
| 426 | 4378.368 | 2691.17 | 5236.605 | 5014.043 | 4750 | 1357.6 | 2212.462 | 4615.767 | 4533.328 | 5714.684 | 2996.23 | 4263.206 | 4159.138 |
| 427 | 4378.286 | 2689.286 | 5236.605 | 5014.043 | 4750 | 1357.6 | 2212.462 | 4615.767 | 4533.328 | 5714.684 | 2996.23 | 4262.769 | 4159.138 |
| 428 | 4378.204 | 2687.404 | 5236.605 | 5014.043 | 4750 | 1357.6 | 2212.462 | 4615.767 | 4533.328 | 5714.684 | 2996.23 | 4262.332 | 4159.138 |
| 429 | 4378.123 | 2685.524 | 5236.605 | 5014.043 | 4750 | 1357.6 | 2212.462 | 4615.767 | 4533.328 | 5714.684 | 2996.23 | 4261.895 | 4159.138 |
| 430 | 4378.042 | 2683.648 | 5236.605 | 5014.043 | 4750 | 1357.6 | 2212.462 | 4615.767 | 4533.328 | 5714.684 | 2996.23 | 4261.895 | 4159.138 |
| 431 | 4377.961 | 2681.774 | 5236.605 | 5014.043 | 4750 | 1357.6 | 2212.462 | 4615.767 | 4533.328 | 5714.684 | 2996.23 | 4261.458 | 4159.138 |
| 432 | 4377.88 | 2679.902 | 5236.605 | 5014.043 | 4750 | 1357.6 | 2212.462 | 4615.767 | 4533.328 | 5714.684 | 2996.23 | 4261.021 | 4159.138 |
| 433 | 4377.8 | 2678.033 | 5236.605 | 5014.043 | 4750 | 1357.6 | 2212.462 | 4615.767 | 4533.328 | 5714.684 | 2996.23 | 4260.584 | 4159.138 |
| 434 | 4377.719 | 2676.167 | 5236.605 | 5014.043 | 4750 | 1357.6 | 2212.462 | 4615.767 | 4533.328 | 5714.684 | 2996.23 | 4260.148 | 4159.138 |
| 435 | 4377.639 | 2674.304 | 5236.605 | 5014.043 | 4750 | 1357.6 | 2212.462 | 4615.767 | 4533.328 | 5714.684 | 2996.23 | 4260.148 | 4159.138 |
| 436 | 4377.559 | 2672.443 | 5236.605 | 5014.043 | 4750 | 1357.6 | 2212.462 | 4615.767 | 4533.328 | 5714.684 | 2996.23 | 4259.711 | 4159.138 |
| 437 | 4377.48 | 2670.584 | 5236.605 | 5014.043 | 4750 | 1357.6 | 2212.462 | 4615.767 | 4533.328 | 5714.684 | 2996.23 | 4259.274 | 4159.138 |
| 438 | 4377.4 | 2668.728 | 5236.605 | 5014.043 | 4750 | 1357.6 | 2212.462 | 4615.767 | 4533.328 | 5714.684 | 2996.23 | 4258.838 | 4159.138 |
| 439 | 4377.32 | 2666.875 | 5236.605 | 5014.043 | 4750 | 1357.6 | 2212.462 | 4615.767 | 4533.328 | 5714.684 | 2996.23 | 4258.838 | 4159.138 |
| 440 | 4377.241 | 2665.024 | 5236.605 | 5014.043 | 4750 | 1357.6 | 2212.462 | 4615.767 | 4533.328 | 5714.684 | 2996.23 | 4258.402 | 4159.138 |
| 441 | 4377.162 | 2663.176 | 5236.605 | 5014.043 | 4750 | 1357.6 | 2212.462 | 4615.767 | 4533.328 | 5714.684 | 2996.23 | 4257.965 | 4159.138 |
| 442 | 4377.083 | 2661.331 | 5236.605 | 5014.043 | 4750 | 1357.6 | 2212.462 | 4615.767 | 4533.328 | 5714.684 | 2996.23 | 4257.529 | 4159.138 |
| 443 | 4377.005 | 2659.488 | 5236.605 | 5014.043 | 4750 | 1357.6 | 2212.462 | 4615.767 | 4533.328 | 5714.684 | 2996.23 | 4257.529 | 4159.138 |
| 444 | 4376.926 | 2657.647 | 5236.605 | 5014.043 | 4750 | 1357.6 | 2212.462 | 4615.767 | 4533.328 | 5714.684 | 2996.23 | 4257.093 | 4159.138 |
| 445 | 4376.848 | 2655.809 | 5236.605 | 5014.043 | 4750 | 1357.6 | 2212.462 | 4615.767 | 4533.328 | 5714.684 | 2996.23 | 4256.657 | 4159.138 |
| 446 | 4376.77 | 2653.974 | 5236.605 | 5014.043 | 4750 | 1357.6 | 2212.462 | 4615.767 | 4533.328 | 5714.684 | 2996.23 | 4256.221 | 4159.138 |
| 447 | 4376.692 | 2652.141 | 5236.605 | 5014.043 | 4750 | 1357.6 | 2212.462 | 4615.767 | 4533.328 | 5714.684 | 2996.23 | 4256.221 | 4159.138 |
| 448 | 4376.614 | 2650.311 | 5236.605 | 5014.043 | 4750 | 1357.6 | 2212.462 | 4615.767 | 4533.328 | 5714.684 | 2996.23 | 4255.785 | 4159.138 |
| 449 | 4376.536 | 2648.483 | 5236.605 | 5014.043 | 4750 | 1357.6 | 2212.462 | 4615.767 | 4533.328 | 5714.684 | 2996.23 | 4255.35 | 4159.138 |
| 450 | 4376.459 | 2646.657 | 5236.605 | 5014.043 | 4750 | 1357.6 | 2212.462 | 4615.767 | 4533.328 | 5714.684 | 2996.23 | 4254.914 | 4159.138 |
| 451 | 4376.381 | 2644.835 | 5236.605 | 5014.043 | 4750 | 1357.6 | 2212.462 | 4615.767 | 4533.328 | 5714.684 | 2996.23 | 4254.914 | 4159.138 |
| 452 | 4376.304 | 2643.014 | 5236.605 | 5014.043 | 4750 | 1357.6 | 2212.462 | 4615.767 | 4533.328 | 5714.684 | 2996.23 | 4254.478 | 4159.138 |
| 453 | 4376.227 | 2641.197 | 5236.605 | 5014.043 | 4750 | 1357.6 | 2212.462 | 4615.767 | 4533.328 | 5714.684 | 2996.23 | 4254.043 | 4159.138 |
| 454 | 4376.151 | 2639.381 | 5236.605 | 5014.043 | 4750 | 1357.6 | 2212.462 | 4615.767 | 4533.328 | 5714.684 | 2996.23 | 4253.608 | 4159.138 |
| 455 | 4376.074 | 2637.569 | 5236.605 | 5014.043 | 4750 | 1357.6 | 2212.462 | 4615.767 | 4533.328 | 5714.684 | 2996.23 | 4253.608 | 4159.138 |
| 456 | 4375.998 | 2635.758 | 5236.605 | 5014.043 | 4750 | 1357.6 | 2212.462 | 4615.767 | 4533.328 | 5714.684 | 2996.23 | 4253.172 | 4159.138 |
| 457 | 4375.921 | 2633.951 | 5236.605 | 5014.043 | 4750 | 1357.6 | 2212.462 | 4615.767 | 4533.328 | 5714.684 | 2996.23 | 4252.737 | 4159.138 |
| 458 | 4375.845 | 2632.145 | 5236.605 | 5014.043 | 4750 | 1357.6 | 2212.462 | 4615.767 | 4533.328 | 5714.684 | 2996.23 | 4252.737 | 4159.138 |
| 459 | 4375.769 | 2630.342 | 5236.605 | 5014.043 | 4750 | 1357.6 | 2212.462 | 4615.767 | 4533.328 | 5714.684 | 2996.23 | 4252.302 | 4159.138 |
| 460 | 4375.694 | 2628.542 | 5236.605 | 5014.043 | 4750 | 1357.6 | 2212.462 | 4615.767 | 4533.328 | 5714.684 | 2996.23 | 4251.867 | 4159.138 |
| 461 | 4375.618 | 2626.744 | 5236.605 | 5014.043 | 4750 | 1357.6 | 2212.462 | 4615.767 | 4533.328 | 5714.684 | 2996.23 | 4251.432 | 4159.138 |
| 462 | 4375.543 | 2624.949 | 5236.605 | 5014.043 | 4750 | 1357.6 | 2212.462 | 4615.767 | 4533.328 | 5714.684 | 2996.23 | 4251.432 | 4159.138 |
| 463 | 4375.467 | 2623.156 | 5236.605 | 5014.043 | 4750 | 1357.6 | 2212.462 | 4615.767 | 4533.328 | 5714.684 | 2996.23 | 4250.997 | 4159.138 |
| 464 | 4375.392 | 2621.365 | 5236.605 | 5014.043 | 4750 | 1357.6 | 2212.462 | 4615.767 | 4533.328 | 5714.684 | 2996.23 | 4250.562 | 4159.138 |
| 465 | 4375.317 | 2619.577 | 5236.605 | 5014.043 | 4750 | 1357.6 | 2212.462 | 4615.767 | 4533.328 | 5714.684 | 2996.23 | 4250.562 | 4159.138 |
| 466 | 4375.243 | 2617.791 | 5236.605 | 5014.043 | 4750 | 1357.6 | 2212.462 | 4615.767 | 4533.328 | 5714.684 | 2996.23 | 4250.128 | 4159.138 |
| 467 | 4375.168 | 2616.008 | 5236.605 | 5014.043 | 4750 | 1357.6 | 2212.462 | 4615.767 | 4533.328 | 5714.684 | 2996.23 | 4249.693 | 4159.138 |
| 468 | 4375.094 | 2614.227 | 5236.605 | 5014.043 | 4750 | 1357.6 | 2212.462 | 4615.767 | 4533.328 | 5714.684 | 2996.23 | 4249.259 | 4159.138 |
| 469 | 4375.019 | 2612.449 | 5236.605 | 5014.043 | 4750 | 1357.6 | 2212.462 | 4615.767 | 4533.328 | 5714.684 | 2996.23 | 4249.259 | 4159.138 |
| 470 | 4374.945 | 2610.673 | 5236.605 | 5014.043 | 4750 | 1357.6 | 2212.462 | 4615.767 | 4533.328 | 5714.684 | 2996.23 | 4248.824 | 4159.138 |
| 471 | 4374.871 | 2608.899 | 5236.605 | 5014.043 | 4750 | 1357.6 | 2212.462 | 4615.767 | 4533.328 | 5714.684 | 2996.23 | 4248.39 | 4159.138 |
| 472 | 4374.797 | 2607.128 | 5236.605 | 5014.043 | 4750 | 1357.6 | 2212.462 | 4615.767 | 4533.328 | 5714.684 | 2996.23 | 4248.39 | 4159.138 |
| 473 | 4374.724 | 2605.36 | 5236.605 | 5014.043 | 4750 | 1357.6 | 2212.462 | 4615.767 | 4533.328 | 5714.684 | 2996.23 | 4247.956 | 4159.138 |
| 474 | 4374.65 | 2603.593 | 5236.605 | 5014.043 | 4750 | 1357.6 | 2212.462 | 4615.767 | 4533.328 | 5714.684 | 2996.23 | 4247.522 | 4159.138 |
| 475 | 4374.577 | 2601.829 | 5236.605 | 5014.043 | 4750 | 1357.6 | 2212.462 | 4615.767 | 4533.328 | 5714.684 | 2996.23 | 4247.088 | 4159.138 |
| 476 | 4374.504 | 2600.068 | 5236.605 | 5014.043 | 4750 | 1357.6 | 2212.462 | 4615.767 | 4533.328 | 5714.684 | 2996.23 | 4247.088 | 4159.138 |
| 477 | 4374.431 | 2598.309 | 5236.605 | 5014.043 | 4750 | 1357.6 | 2212.462 | 4615.767 | 4533.328 | 5714.684 | 2996.23 | 4246.654 | 4159.138 |
| 478 | 4374.358 | 2596.552 | 5236.605 | 5014.043 | 4750 | 1357.6 | 2212.462 | 4615.767 | 4533.328 | 5714.684 | 2996.23 | 4246.22 | 4159.138 |
| 479 | 4374.285 | 2594.797 | 5236.605 | 5014.043 | 4750 | 1357.6 | 2212.462 | 4615.767 | 4533.328 | 5714.684 | 2996.23 | 4246.22 | 4159.138 |
| 480 | 4374.213 | 2593.045 | 5236.605 | 5014.043 | 4750 | 1357.6 | 2212.462 | 4615.767 | 4533.328 | 5714.684 | 2996.23 | 4245.786 | 4159.138 |
| 481 | 4374.14 | 2591.296 | 5236.605 | 5014.043 | 4750 | 1357.6 | 2212.462 | 4615.767 | 4533.328 | 5714.684 | 2996.23 | 4245.352 | 4159.138 |
| 482 | 4374.068 | 2589.548 | 5236.605 | 5014.043 | 4750 | 1357.6 | 2212.462 | 4615.767 | 4533.328 | 5714.684 | 2996.23 | 4245.352 | 4159.138 |
| 483 | 4373.996 | 2587.803 | 5236.605 | 5014.043 | 4750 | 1357.6 | 2212.462 | 4615.767 | 4533.328 | 5714.684 | 2996.23 | 4244.919 | 4159.138 |
| 484 | 4373.924 | 2586.061 | 5236.605 | 5014.043 | 4750 | 1357.6 | 2212.462 | 4615.767 | 4533.328 | 5714.684 | 2996.23 | 4244.485 | 4159.138 |
| 485 | 4373.852 | 2584.32 | 5236.605 | 5014.043 | 4750 | 1357.6 | 2212.462 | 4615.767 | 4533.328 | 5714.684 | 2996.23 | 4244.485 | 4159.138 |
| 486 | 4373.781 | 2582.582 | 5236.605 | 5014.043 | 4750 | 1357.6 | 2212.462 | 4615.767 | 4533.328 | 5714.684 | 2996.23 | 4244.052 | 4159.138 |
| 487 | 4373.709 | 2580.847 | 5236.605 | 5014.043 | 4750 | 1357.6 | 2212.462 | 4615.767 | 4533.328 | 5714.684 | 2996.23 | 4243.619 | 4159.138 |
| 488 | 4373.638 | 2579.113 | 5236.605 | 5014.043 | 4750 | 1357.6 | 2212.462 | 4615.767 | 4533.328 | 5714.684 | 2996.23 | 4243.185 | 4159.138 |
| 489 | 4373.567 | 2577.383 | 5236.605 | 5014.043 | 4750 | 1357.6 | 2212.462 | 4615.767 | 4533.328 | 5714.684 | 2996.23 | 4243.185 | 4159.138 |
| 490 | 4373.496 | 2575.654 | 5236.605 | 5014.043 | 4750 | 1357.6 | 2212.462 | 4615.767 | 4533.328 | 5714.684 | 2996.23 | 4242.752 | 4159.138 |
| 491 | 4373.425 | 2573.928 | 5236.605 | 5014.043 | 4750 | 1357.6 | 2212.462 | 4615.767 | 4533.328 | 5714.684 | 2996.23 | 4242.319 | 4159.138 |
| 492 | 4373.354 | 2572.204 | 5236.605 | 5014.043 | 4750 | 1357.6 | 2212.462 | 4615.767 | 4533.328 | 5714.684 | 2996.23 | 4242.319 | 4159.138 |
| 493 | 4373.283 | 2570.482 | 5236.605 | 5014.043 | 4750 | 1357.6 | 2212.462 | 4615.767 | 4533.328 | 5714.684 | 2996.23 | 4241.886 | 4159.138 |
| 494 | 4373.213 | 2568.763 | 5236.605 | 5014.043 | 4750 | 1357.6 | 2212.462 | 4615.767 | 4533.328 | 5714.684 | 2996.23 | 4241.453 | 4159.138 |
| 495 | 4373.143 | 2567.045 | 5236.605 | 5014.043 | 4750 | 1357.6 | 2212.462 | 4615.767 | 4533.328 | 5714.684 | 2996.23 | 4241.453 | 4159.138 |
| 496 | 4373.072 | 2565.331 | 5236.605 | 5014.043 | 4750 | 1357.6 | 2212.462 | 4615.767 | 4533.328 | 5714.684 | 2996.23 | 4241.02 | 4159.138 |
| 497 | 4373.002 | 2563.618 | 5236.605 | 5014.043 | 4750 | 1357.6 | 2212.462 | 4615.767 | 4533.328 | 5714.684 | 2996.23 | 4240.588 | 4159.138 |
| 498 | 4372.932 | 2561.908 | 5236.605 | 5014.043 | 4750 | 1357.6 | 2212.462 | 4615.767 | 4533.328 | 5714.684 | 2996.23 | 4240.588 | 4159.138 |
| 499 | 4372.863 | 2560.2 | 5236.605 | 5014.043 | 4750 | 1357.6 | 2212.462 | 4615.767 | 4533.328 | 5714.684 | 2996.23 | 4240.155 | 4159.138 |